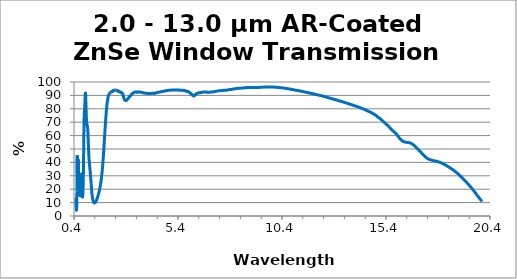
| Category | Series 1 |
|---|---|
| 0.5 | 8.167 |
| 0.501 | 10.081 |
| 0.502 | 11.8 |
| 0.503 | 13.063 |
| 0.504 | 13.66 |
| 0.505 | 13.523 |
| 0.506 | 12.763 |
| 0.507 | 11.568 |
| 0.508 | 10.196 |
| 0.509 | 8.844 |
| 0.51 | 7.629 |
| 0.511 | 6.625 |
| 0.512 | 5.827 |
| 0.513 | 5.228 |
| 0.514 | 4.792 |
| 0.515 | 4.489 |
| 0.516 | 4.301 |
| 0.517 | 4.211 |
| 0.518 | 4.211 |
| 0.519 | 4.28 |
| 0.52 | 4.416 |
| 0.521 | 4.606 |
| 0.522 | 4.855 |
| 0.523 | 5.154 |
| 0.524 | 5.504 |
| 0.525 | 5.9 |
| 0.526 | 6.349 |
| 0.527 | 6.841 |
| 0.528 | 7.367 |
| 0.529 | 7.934 |
| 0.53 | 8.549 |
| 0.531 | 9.206 |
| 0.532 | 9.9 |
| 0.533 | 10.646 |
| 0.534 | 11.454 |
| 0.535 | 12.329 |
| 0.536 | 13.289 |
| 0.537 | 14.353 |
| 0.538 | 15.541 |
| 0.539 | 16.882 |
| 0.54 | 18.368 |
| 0.541 | 20.038 |
| 0.542 | 21.914 |
| 0.543 | 23.991 |
| 0.544 | 26.266 |
| 0.545 | 28.727 |
| 0.546 | 31.334 |
| 0.547 | 34.025 |
| 0.548 | 36.642 |
| 0.549 | 39.138 |
| 0.55 | 41.369 |
| 0.551 | 43.197 |
| 0.552 | 44.516 |
| 0.553 | 45.275 |
| 0.554 | 45.439 |
| 0.555 | 45.029 |
| 0.556 | 44.108 |
| 0.557 | 42.786 |
| 0.558 | 41.137 |
| 0.559 | 39.322 |
| 0.56 | 37.417 |
| 0.561 | 35.484 |
| 0.562 | 33.618 |
| 0.563 | 31.849 |
| 0.564 | 30.203 |
| 0.565 | 28.693 |
| 0.566 | 27.32 |
| 0.567 | 26.108 |
| 0.568 | 25.045 |
| 0.569 | 24.116 |
| 0.57 | 23.332 |
| 0.571 | 22.684 |
| 0.572 | 22.15 |
| 0.573 | 21.728 |
| 0.574 | 21.409 |
| 0.575 | 21.194 |
| 0.576 | 21.08 |
| 0.577 | 21.055 |
| 0.578 | 21.123 |
| 0.579 | 21.275 |
| 0.58 | 21.517 |
| 0.581 | 21.844 |
| 0.582 | 22.261 |
| 0.583 | 22.756 |
| 0.584 | 23.338 |
| 0.585 | 24.003 |
| 0.586 | 24.754 |
| 0.587 | 25.578 |
| 0.588 | 26.495 |
| 0.589 | 27.486 |
| 0.59 | 28.552 |
| 0.591 | 29.668 |
| 0.592 | 30.85 |
| 0.593 | 32.082 |
| 0.594 | 33.333 |
| 0.595 | 34.589 |
| 0.596 | 35.844 |
| 0.597 | 37.054 |
| 0.598 | 38.201 |
| 0.599 | 39.252 |
| 0.6 | 40.191 |
| 0.601 | 40.987 |
| 0.602 | 41.613 |
| 0.603 | 42.057 |
| 0.604 | 42.317 |
| 0.605 | 42.388 |
| 0.606 | 42.27 |
| 0.607 | 41.987 |
| 0.608 | 41.544 |
| 0.609 | 40.96 |
| 0.61 | 40.272 |
| 0.611 | 39.497 |
| 0.612 | 38.648 |
| 0.613 | 37.758 |
| 0.614 | 36.842 |
| 0.615 | 35.912 |
| 0.616 | 34.985 |
| 0.617 | 34.065 |
| 0.618 | 33.177 |
| 0.619 | 32.313 |
| 0.62 | 31.468 |
| 0.621 | 30.663 |
| 0.622 | 29.898 |
| 0.623 | 29.156 |
| 0.624 | 28.45 |
| 0.625 | 27.774 |
| 0.626 | 27.131 |
| 0.627 | 26.511 |
| 0.628 | 25.91 |
| 0.629 | 25.338 |
| 0.63 | 24.787 |
| 0.631 | 24.244 |
| 0.632 | 23.722 |
| 0.633 | 23.208 |
| 0.634 | 22.71 |
| 0.635 | 22.218 |
| 0.636 | 21.73 |
| 0.637 | 21.263 |
| 0.638 | 20.8 |
| 0.639 | 20.343 |
| 0.64 | 19.899 |
| 0.641 | 19.468 |
| 0.642 | 19.05 |
| 0.643 | 18.648 |
| 0.644 | 18.257 |
| 0.645 | 17.89 |
| 0.646 | 17.542 |
| 0.647 | 17.212 |
| 0.648 | 16.907 |
| 0.649 | 16.627 |
| 0.65 | 16.372 |
| 0.651 | 16.142 |
| 0.652 | 15.938 |
| 0.653 | 15.766 |
| 0.654 | 15.622 |
| 0.655 | 15.507 |
| 0.656 | 15.422 |
| 0.657 | 15.37 |
| 0.658 | 15.35 |
| 0.659 | 15.362 |
| 0.66 | 15.406 |
| 0.661 | 15.481 |
| 0.662 | 15.594 |
| 0.663 | 15.738 |
| 0.664 | 15.918 |
| 0.665 | 16.129 |
| 0.666 | 16.376 |
| 0.667 | 16.658 |
| 0.668 | 16.978 |
| 0.669 | 17.326 |
| 0.67 | 17.708 |
| 0.671 | 18.125 |
| 0.672 | 18.568 |
| 0.673 | 19.038 |
| 0.674 | 19.537 |
| 0.675 | 20.058 |
| 0.676 | 20.592 |
| 0.677 | 21.137 |
| 0.678 | 21.689 |
| 0.679 | 22.241 |
| 0.68 | 22.78 |
| 0.681 | 23.302 |
| 0.682 | 23.8 |
| 0.683 | 24.274 |
| 0.684 | 24.687 |
| 0.685 | 25.048 |
| 0.686 | 25.348 |
| 0.687 | 25.58 |
| 0.688 | 25.739 |
| 0.689 | 25.82 |
| 0.69 | 25.824 |
| 0.691 | 25.744 |
| 0.692 | 25.598 |
| 0.693 | 25.375 |
| 0.694 | 25.082 |
| 0.695 | 24.734 |
| 0.696 | 24.339 |
| 0.697 | 23.9 |
| 0.698 | 23.423 |
| 0.699 | 22.928 |
| 0.7 | 22.416 |
| 0.701 | 21.892 |
| 0.702 | 21.364 |
| 0.703 | 20.84 |
| 0.704 | 20.328 |
| 0.705 | 19.827 |
| 0.706 | 19.339 |
| 0.707 | 18.876 |
| 0.708 | 18.434 |
| 0.709 | 18.015 |
| 0.71 | 17.621 |
| 0.711 | 17.255 |
| 0.712 | 16.914 |
| 0.713 | 16.602 |
| 0.714 | 16.319 |
| 0.715 | 16.061 |
| 0.716 | 15.836 |
| 0.717 | 15.633 |
| 0.718 | 15.461 |
| 0.719 | 15.315 |
| 0.72 | 15.204 |
| 0.721 | 15.119 |
| 0.722 | 15.06 |
| 0.723 | 15.029 |
| 0.724 | 15.023 |
| 0.725 | 15.043 |
| 0.726 | 15.093 |
| 0.727 | 15.173 |
| 0.728 | 15.271 |
| 0.729 | 15.403 |
| 0.73 | 15.564 |
| 0.731 | 15.747 |
| 0.732 | 15.966 |
| 0.733 | 16.222 |
| 0.734 | 16.493 |
| 0.735 | 16.799 |
| 0.736 | 17.148 |
| 0.737 | 17.511 |
| 0.738 | 17.91 |
| 0.739 | 18.363 |
| 0.74 | 18.842 |
| 0.741 | 19.329 |
| 0.742 | 19.872 |
| 0.743 | 20.439 |
| 0.744 | 21.027 |
| 0.745 | 21.662 |
| 0.746 | 22.339 |
| 0.747 | 22.996 |
| 0.748 | 23.696 |
| 0.749 | 24.421 |
| 0.75 | 25.111 |
| 0.751 | 25.856 |
| 0.752 | 26.598 |
| 0.753 | 27.283 |
| 0.754 | 27.966 |
| 0.755 | 28.629 |
| 0.756 | 29.221 |
| 0.757 | 29.774 |
| 0.758 | 30.281 |
| 0.759 | 30.695 |
| 0.76 | 31.026 |
| 0.761 | 31.28 |
| 0.762 | 31.449 |
| 0.763 | 31.51 |
| 0.764 | 31.472 |
| 0.765 | 31.341 |
| 0.766 | 31.126 |
| 0.767 | 30.812 |
| 0.768 | 30.414 |
| 0.769 | 29.973 |
| 0.77 | 29.439 |
| 0.771 | 28.844 |
| 0.772 | 28.253 |
| 0.773 | 27.609 |
| 0.774 | 26.926 |
| 0.775 | 26.258 |
| 0.776 | 25.56 |
| 0.777 | 24.847 |
| 0.778 | 24.179 |
| 0.779 | 23.513 |
| 0.78 | 22.838 |
| 0.781 | 22.221 |
| 0.782 | 21.611 |
| 0.783 | 20.996 |
| 0.784 | 20.426 |
| 0.785 | 19.903 |
| 0.786 | 19.388 |
| 0.787 | 18.9 |
| 0.788 | 18.455 |
| 0.789 | 18.013 |
| 0.79 | 17.596 |
| 0.791 | 17.235 |
| 0.792 | 16.879 |
| 0.793 | 16.546 |
| 0.794 | 16.256 |
| 0.795 | 15.969 |
| 0.796 | 15.7 |
| 0.797 | 15.474 |
| 0.798 | 15.259 |
| 0.799 | 15.068 |
| 0.8 | 14.89 |
| 0.801 | 14.734 |
| 0.802 | 14.595 |
| 0.803 | 14.482 |
| 0.804 | 14.384 |
| 0.805 | 14.303 |
| 0.806 | 14.239 |
| 0.807 | 14.193 |
| 0.808 | 14.164 |
| 0.809 | 14.148 |
| 0.81 | 14.152 |
| 0.811 | 14.17 |
| 0.812 | 14.205 |
| 0.813 | 14.252 |
| 0.814 | 14.321 |
| 0.815 | 14.402 |
| 0.816 | 14.496 |
| 0.817 | 14.614 |
| 0.818 | 14.743 |
| 0.819 | 14.887 |
| 0.82 | 15.054 |
| 0.821 | 15.242 |
| 0.822 | 15.433 |
| 0.823 | 15.645 |
| 0.824 | 15.884 |
| 0.825 | 16.134 |
| 0.826 | 16.402 |
| 0.827 | 16.705 |
| 0.828 | 17.017 |
| 0.829 | 17.343 |
| 0.83 | 17.699 |
| 0.831 | 18.082 |
| 0.832 | 18.471 |
| 0.833 | 18.9 |
| 0.834 | 19.361 |
| 0.835 | 19.819 |
| 0.836 | 20.323 |
| 0.837 | 20.863 |
| 0.838 | 21.4 |
| 0.839 | 22.004 |
| 0.84 | 22.638 |
| 0.841 | 23.266 |
| 0.842 | 23.943 |
| 0.843 | 24.666 |
| 0.844 | 25.396 |
| 0.845 | 26.181 |
| 0.846 | 27.028 |
| 0.847 | 27.866 |
| 0.848 | 28.741 |
| 0.849 | 29.678 |
| 0.85 | 30.638 |
| 0.851 | 31.63 |
| 0.852 | 32.696 |
| 0.853 | 33.784 |
| 0.854 | 34.853 |
| 0.855 | 36.014 |
| 0.856 | 37.208 |
| 0.857 | 38.394 |
| 0.858 | 39.672 |
| 0.859 | 40.986 |
| 0.86 | 42.231 |
| 0.861 | 43.575 |
| 0.862 | 44.962 |
| 0.863 | 46.291 |
| 0.864 | 47.688 |
| 0.865 | 49.127 |
| 0.866 | 50.5 |
| 0.867 | 51.877 |
| 0.868 | 53.328 |
| 0.869 | 54.695 |
| 0.87 | 56.08 |
| 0.871 | 57.475 |
| 0.872 | 58.806 |
| 0.873 | 60.067 |
| 0.874 | 61.346 |
| 0.875 | 62.574 |
| 0.876 | 63.724 |
| 0.877 | 64.896 |
| 0.878 | 66.011 |
| 0.879 | 66.995 |
| 0.88 | 67.979 |
| 0.881 | 68.923 |
| 0.882 | 69.754 |
| 0.883 | 70.574 |
| 0.884 | 71.343 |
| 0.885 | 72.017 |
| 0.886 | 72.65 |
| 0.887 | 73.262 |
| 0.888 | 73.793 |
| 0.889 | 74.295 |
| 0.89 | 74.761 |
| 0.891 | 75.169 |
| 0.892 | 75.544 |
| 0.893 | 75.892 |
| 0.894 | 76.199 |
| 0.895 | 76.482 |
| 0.896 | 76.756 |
| 0.897 | 77.002 |
| 0.898 | 77.223 |
| 0.899 | 77.469 |
| 0.9 | 77.683 |
| 0.901 | 77.876 |
| 0.902 | 78.075 |
| 0.903 | 78.272 |
| 0.904 | 78.454 |
| 0.905 | 78.653 |
| 0.906 | 78.861 |
| 0.907 | 79.06 |
| 0.908 | 79.281 |
| 0.909 | 79.486 |
| 0.91 | 79.716 |
| 0.911 | 79.971 |
| 0.912 | 80.227 |
| 0.913 | 80.496 |
| 0.914 | 80.778 |
| 0.915 | 81.091 |
| 0.916 | 81.397 |
| 0.917 | 81.714 |
| 0.918 | 82.055 |
| 0.919 | 82.4 |
| 0.92 | 82.756 |
| 0.921 | 83.138 |
| 0.922 | 83.527 |
| 0.923 | 83.9 |
| 0.924 | 84.3 |
| 0.925 | 84.712 |
| 0.926 | 85.102 |
| 0.927 | 85.527 |
| 0.928 | 85.949 |
| 0.929 | 86.349 |
| 0.93 | 86.76 |
| 0.931 | 87.176 |
| 0.932 | 87.568 |
| 0.933 | 87.97 |
| 0.934 | 88.375 |
| 0.935 | 88.75 |
| 0.936 | 89.107 |
| 0.937 | 89.457 |
| 0.938 | 89.792 |
| 0.939 | 90.093 |
| 0.94 | 90.394 |
| 0.941 | 90.652 |
| 0.942 | 90.898 |
| 0.943 | 91.121 |
| 0.944 | 91.315 |
| 0.945 | 91.476 |
| 0.946 | 91.605 |
| 0.947 | 91.714 |
| 0.948 | 91.777 |
| 0.949 | 91.82 |
| 0.95 | 91.826 |
| 0.951 | 91.788 |
| 0.952 | 91.728 |
| 0.953 | 91.632 |
| 0.954 | 91.51 |
| 0.955 | 91.356 |
| 0.956 | 91.154 |
| 0.957 | 90.932 |
| 0.958 | 90.684 |
| 0.959 | 90.387 |
| 0.96 | 90.078 |
| 0.961 | 89.75 |
| 0.962 | 89.384 |
| 0.963 | 88.993 |
| 0.964 | 88.593 |
| 0.965 | 88.151 |
| 0.966 | 87.7 |
| 0.967 | 87.253 |
| 0.968 | 86.768 |
| 0.969 | 86.264 |
| 0.97 | 85.776 |
| 0.971 | 85.249 |
| 0.972 | 84.711 |
| 0.973 | 84.202 |
| 0.974 | 83.662 |
| 0.975 | 83.116 |
| 0.976 | 82.59 |
| 0.977 | 82.04 |
| 0.978 | 81.481 |
| 0.979 | 80.952 |
| 0.98 | 80.432 |
| 0.981 | 79.889 |
| 0.982 | 79.375 |
| 0.983 | 78.869 |
| 0.984 | 78.347 |
| 0.985 | 77.834 |
| 0.986 | 77.366 |
| 0.987 | 76.88 |
| 0.988 | 76.408 |
| 0.989 | 75.969 |
| 0.99 | 75.504 |
| 0.991 | 75.059 |
| 0.992 | 74.655 |
| 0.993 | 74.253 |
| 0.994 | 73.856 |
| 0.995 | 73.488 |
| 0.996 | 73.117 |
| 0.997 | 72.754 |
| 0.998 | 72.428 |
| 0.999 | 72.111 |
| 1.0 | 71.8 |
| 1.001 | 71.507 |
| 1.002 | 71.23 |
| 1.003 | 70.954 |
| 1.004 | 70.706 |
| 1.005 | 70.47 |
| 1.006 | 70.245 |
| 1.007 | 70.032 |
| 1.008 | 69.839 |
| 1.009 | 69.642 |
| 1.01 | 69.466 |
| 1.011 | 69.301 |
| 1.012 | 69.147 |
| 1.013 | 69.003 |
| 1.014 | 68.878 |
| 1.015 | 68.753 |
| 1.016 | 68.638 |
| 1.017 | 68.54 |
| 1.018 | 68.436 |
| 1.019 | 68.346 |
| 1.02 | 68.267 |
| 1.021 | 68.195 |
| 1.022 | 68.13 |
| 1.023 | 68.069 |
| 1.024 | 68.015 |
| 1.025 | 67.958 |
| 1.026 | 67.909 |
| 1.027 | 67.864 |
| 1.028 | 67.821 |
| 1.029 | 67.779 |
| 1.03 | 67.738 |
| 1.031 | 67.7 |
| 1.032 | 67.661 |
| 1.033 | 67.624 |
| 1.034 | 67.575 |
| 1.035 | 67.535 |
| 1.036 | 67.49 |
| 1.037 | 67.437 |
| 1.038 | 67.389 |
| 1.039 | 67.336 |
| 1.04 | 67.276 |
| 1.041 | 67.204 |
| 1.042 | 67.134 |
| 1.043 | 67.052 |
| 1.044 | 66.962 |
| 1.045 | 66.872 |
| 1.046 | 66.775 |
| 1.047 | 66.66 |
| 1.048 | 66.541 |
| 1.049 | 66.423 |
| 1.05 | 66.336 |
| 1.051 | 66.194 |
| 1.052 | 66.045 |
| 1.053 | 65.891 |
| 1.054 | 65.702 |
| 1.055 | 65.532 |
| 1.056 | 65.322 |
| 1.057 | 65.101 |
| 1.058 | 64.9 |
| 1.059 | 64.664 |
| 1.06 | 64.417 |
| 1.061 | 64.182 |
| 1.062 | 63.941 |
| 1.063 | 63.666 |
| 1.064 | 63.391 |
| 1.065 | 63.089 |
| 1.066 | 62.783 |
| 1.067 | 62.478 |
| 1.068 | 62.163 |
| 1.069 | 61.833 |
| 1.07 | 61.508 |
| 1.071 | 61.172 |
| 1.072 | 60.811 |
| 1.073 | 60.447 |
| 1.074 | 60.108 |
| 1.075 | 59.724 |
| 1.076 | 59.348 |
| 1.077 | 58.987 |
| 1.078 | 58.596 |
| 1.079 | 58.195 |
| 1.08 | 57.815 |
| 1.081 | 57.425 |
| 1.082 | 57.031 |
| 1.083 | 56.64 |
| 1.084 | 56.233 |
| 1.085 | 55.828 |
| 1.086 | 55.438 |
| 1.087 | 55.046 |
| 1.088 | 54.644 |
| 1.089 | 54.252 |
| 1.09 | 53.857 |
| 1.091 | 53.438 |
| 1.092 | 53.043 |
| 1.093 | 52.661 |
| 1.094 | 52.256 |
| 1.095 | 51.876 |
| 1.096 | 51.491 |
| 1.097 | 51.088 |
| 1.098 | 50.721 |
| 1.099 | 50.374 |
| 1.1 | 49.993 |
| 1.101 | 49.622 |
| 1.102 | 49.274 |
| 1.103 | 48.91 |
| 1.104 | 48.531 |
| 1.105 | 48.199 |
| 1.106 | 47.851 |
| 1.107 | 47.521 |
| 1.108 | 47.18 |
| 1.109 | 46.849 |
| 1.11 | 46.521 |
| 1.111 | 46.201 |
| 1.112 | 45.895 |
| 1.113 | 45.584 |
| 1.114 | 45.28 |
| 1.115 | 44.989 |
| 1.116 | 44.684 |
| 1.117 | 44.395 |
| 1.118 | 44.127 |
| 1.119 | 43.844 |
| 1.12 | 43.58 |
| 1.121 | 43.316 |
| 1.122 | 43.049 |
| 1.123 | 42.777 |
| 1.124 | 42.534 |
| 1.125 | 42.275 |
| 1.126 | 42.033 |
| 1.127 | 41.804 |
| 1.128 | 41.592 |
| 1.129 | 41.352 |
| 1.13 | 41.134 |
| 1.131 | 40.917 |
| 1.132 | 40.692 |
| 1.133 | 40.487 |
| 1.134 | 40.286 |
| 1.135 | 40.075 |
| 1.136 | 39.869 |
| 1.137 | 39.686 |
| 1.138 | 39.493 |
| 1.139 | 39.316 |
| 1.14 | 39.13 |
| 1.141 | 38.939 |
| 1.142 | 38.766 |
| 1.143 | 38.607 |
| 1.144 | 38.43 |
| 1.145 | 38.255 |
| 1.146 | 38.103 |
| 1.147 | 37.924 |
| 1.148 | 37.757 |
| 1.149 | 37.609 |
| 1.15 | 37.449 |
| 1.151 | 37.296 |
| 1.152 | 37.136 |
| 1.153 | 36.989 |
| 1.154 | 36.833 |
| 1.155 | 36.678 |
| 1.156 | 36.535 |
| 1.157 | 36.385 |
| 1.158 | 36.248 |
| 1.159 | 36.094 |
| 1.16 | 35.939 |
| 1.161 | 35.792 |
| 1.162 | 35.649 |
| 1.163 | 35.5 |
| 1.164 | 35.349 |
| 1.165 | 35.222 |
| 1.166 | 35.058 |
| 1.167 | 34.912 |
| 1.168 | 34.769 |
| 1.169 | 34.624 |
| 1.17 | 34.462 |
| 1.171 | 34.318 |
| 1.172 | 34.163 |
| 1.173 | 34.007 |
| 1.174 | 33.86 |
| 1.175 | 33.698 |
| 1.176 | 33.54 |
| 1.177 | 33.389 |
| 1.178 | 33.226 |
| 1.179 | 33.052 |
| 1.18 | 32.888 |
| 1.181 | 32.73 |
| 1.182 | 32.557 |
| 1.183 | 32.385 |
| 1.184 | 32.226 |
| 1.185 | 32.042 |
| 1.186 | 31.866 |
| 1.187 | 31.697 |
| 1.188 | 31.517 |
| 1.189 | 31.332 |
| 1.19 | 31.149 |
| 1.191 | 30.956 |
| 1.192 | 30.77 |
| 1.193 | 30.589 |
| 1.194 | 30.393 |
| 1.195 | 30.196 |
| 1.196 | 30.012 |
| 1.197 | 29.81 |
| 1.198 | 29.606 |
| 1.199 | 29.411 |
| 1.2 | 29.201 |
| 1.201 | 28.992 |
| 1.202 | 28.792 |
| 1.203 | 28.591 |
| 1.204 | 28.377 |
| 1.205 | 28.167 |
| 1.206 | 27.963 |
| 1.207 | 27.747 |
| 1.208 | 27.538 |
| 1.209 | 27.33 |
| 1.21 | 27.113 |
| 1.211 | 26.893 |
| 1.212 | 26.686 |
| 1.213 | 26.471 |
| 1.214 | 26.252 |
| 1.215 | 26.036 |
| 1.216 | 25.818 |
| 1.217 | 25.597 |
| 1.218 | 25.388 |
| 1.219 | 25.173 |
| 1.22 | 24.949 |
| 1.221 | 24.745 |
| 1.222 | 24.529 |
| 1.223 | 24.303 |
| 1.224 | 24.084 |
| 1.225 | 23.885 |
| 1.226 | 23.664 |
| 1.227 | 23.445 |
| 1.228 | 23.241 |
| 1.229 | 23.025 |
| 1.23 | 22.807 |
| 1.231 | 22.612 |
| 1.232 | 22.402 |
| 1.233 | 22.188 |
| 1.234 | 21.99 |
| 1.235 | 21.774 |
| 1.236 | 21.569 |
| 1.237 | 21.372 |
| 1.238 | 21.177 |
| 1.239 | 20.971 |
| 1.24 | 20.778 |
| 1.241 | 20.587 |
| 1.242 | 20.382 |
| 1.243 | 20.199 |
| 1.244 | 20.013 |
| 1.245 | 19.821 |
| 1.246 | 19.636 |
| 1.247 | 19.451 |
| 1.248 | 19.267 |
| 1.249 | 19.081 |
| 1.25 | 18.912 |
| 1.251 | 18.731 |
| 1.252 | 18.552 |
| 1.253 | 18.388 |
| 1.254 | 18.219 |
| 1.255 | 18.042 |
| 1.256 | 17.882 |
| 1.257 | 17.717 |
| 1.258 | 17.552 |
| 1.259 | 17.403 |
| 1.26 | 17.238 |
| 1.261 | 17.077 |
| 1.262 | 16.929 |
| 1.263 | 16.783 |
| 1.264 | 16.63 |
| 1.265 | 16.483 |
| 1.266 | 16.332 |
| 1.267 | 16.194 |
| 1.268 | 16.055 |
| 1.269 | 15.912 |
| 1.27 | 15.781 |
| 1.271 | 15.641 |
| 1.272 | 15.516 |
| 1.273 | 15.381 |
| 1.274 | 15.244 |
| 1.275 | 15.127 |
| 1.276 | 15.002 |
| 1.277 | 14.877 |
| 1.278 | 14.761 |
| 1.279 | 14.641 |
| 1.28 | 14.518 |
| 1.281 | 14.411 |
| 1.282 | 14.302 |
| 1.283 | 14.187 |
| 1.284 | 14.077 |
| 1.285 | 13.974 |
| 1.286 | 13.861 |
| 1.287 | 13.763 |
| 1.288 | 13.662 |
| 1.289 | 13.56 |
| 1.29 | 13.463 |
| 1.291 | 13.371 |
| 1.292 | 13.268 |
| 1.293 | 13.176 |
| 1.294 | 13.095 |
| 1.295 | 13 |
| 1.296 | 12.912 |
| 1.297 | 12.826 |
| 1.298 | 12.741 |
| 1.299 | 12.65 |
| 1.3 | 12.583 |
| 1.301 | 12.497 |
| 1.302 | 12.416 |
| 1.303 | 12.348 |
| 1.304 | 12.266 |
| 1.305 | 12.188 |
| 1.306 | 12.119 |
| 1.307 | 12.046 |
| 1.308 | 11.977 |
| 1.309 | 11.911 |
| 1.31 | 11.848 |
| 1.311 | 11.775 |
| 1.312 | 11.713 |
| 1.313 | 11.648 |
| 1.314 | 11.596 |
| 1.315 | 11.528 |
| 1.316 | 11.469 |
| 1.317 | 11.411 |
| 1.318 | 11.355 |
| 1.319 | 11.298 |
| 1.32 | 11.243 |
| 1.321 | 11.189 |
| 1.322 | 11.143 |
| 1.323 | 11.092 |
| 1.324 | 11.037 |
| 1.325 | 10.989 |
| 1.326 | 10.943 |
| 1.327 | 10.898 |
| 1.328 | 10.857 |
| 1.329 | 10.807 |
| 1.33 | 10.772 |
| 1.331 | 10.726 |
| 1.332 | 10.685 |
| 1.333 | 10.645 |
| 1.334 | 10.604 |
| 1.335 | 10.57 |
| 1.336 | 10.531 |
| 1.337 | 10.491 |
| 1.338 | 10.46 |
| 1.339 | 10.427 |
| 1.34 | 10.39 |
| 1.341 | 10.359 |
| 1.342 | 10.329 |
| 1.343 | 10.296 |
| 1.344 | 10.27 |
| 1.345 | 10.239 |
| 1.346 | 10.212 |
| 1.347 | 10.183 |
| 1.348 | 10.16 |
| 1.349 | 10.134 |
| 1.35 | 10.113 |
| 1.351 | 10.091 |
| 1.352 | 10.075 |
| 1.353 | 10.043 |
| 1.354 | 10.03 |
| 1.355 | 10.006 |
| 1.356 | 9.983 |
| 1.357 | 9.961 |
| 1.358 | 9.947 |
| 1.359 | 9.933 |
| 1.36 | 9.914 |
| 1.361 | 9.893 |
| 1.362 | 9.883 |
| 1.363 | 9.872 |
| 1.364 | 9.853 |
| 1.365 | 9.847 |
| 1.366 | 9.824 |
| 1.367 | 9.814 |
| 1.368 | 9.811 |
| 1.369 | 9.796 |
| 1.37 | 9.788 |
| 1.371 | 9.782 |
| 1.372 | 9.771 |
| 1.373 | 9.768 |
| 1.374 | 9.757 |
| 1.375 | 9.756 |
| 1.376 | 9.75 |
| 1.377 | 9.744 |
| 1.378 | 9.743 |
| 1.379 | 9.729 |
| 1.38 | 9.732 |
| 1.381 | 9.725 |
| 1.382 | 9.731 |
| 1.383 | 9.727 |
| 1.384 | 9.728 |
| 1.385 | 9.727 |
| 1.386 | 9.727 |
| 1.387 | 9.729 |
| 1.388 | 9.728 |
| 1.389 | 9.731 |
| 1.39 | 9.733 |
| 1.391 | 9.735 |
| 1.392 | 9.741 |
| 1.393 | 9.748 |
| 1.394 | 9.755 |
| 1.395 | 9.756 |
| 1.396 | 9.763 |
| 1.397 | 9.772 |
| 1.398 | 9.773 |
| 1.399 | 9.787 |
| 1.4 | 9.796 |
| 1.401 | 9.804 |
| 1.402 | 9.813 |
| 1.403 | 9.818 |
| 1.404 | 9.827 |
| 1.405 | 9.836 |
| 1.406 | 9.858 |
| 1.407 | 9.86 |
| 1.408 | 9.881 |
| 1.409 | 9.891 |
| 1.41 | 9.897 |
| 1.411 | 9.908 |
| 1.412 | 9.922 |
| 1.413 | 9.942 |
| 1.414 | 9.955 |
| 1.415 | 9.967 |
| 1.416 | 9.99 |
| 1.417 | 10.004 |
| 1.418 | 10.022 |
| 1.419 | 10.036 |
| 1.42 | 10.059 |
| 1.421 | 10.07 |
| 1.422 | 10.089 |
| 1.423 | 10.105 |
| 1.424 | 10.124 |
| 1.425 | 10.147 |
| 1.426 | 10.166 |
| 1.427 | 10.19 |
| 1.428 | 10.209 |
| 1.429 | 10.23 |
| 1.43 | 10.25 |
| 1.431 | 10.273 |
| 1.432 | 10.292 |
| 1.433 | 10.318 |
| 1.434 | 10.334 |
| 1.435 | 10.365 |
| 1.436 | 10.389 |
| 1.437 | 10.416 |
| 1.438 | 10.433 |
| 1.439 | 10.463 |
| 1.44 | 10.483 |
| 1.441 | 10.513 |
| 1.442 | 10.535 |
| 1.443 | 10.565 |
| 1.444 | 10.592 |
| 1.445 | 10.622 |
| 1.446 | 10.643 |
| 1.447 | 10.674 |
| 1.448 | 10.706 |
| 1.449 | 10.734 |
| 1.45 | 10.761 |
| 1.451 | 10.783 |
| 1.452 | 10.821 |
| 1.453 | 10.853 |
| 1.454 | 10.879 |
| 1.455 | 10.908 |
| 1.456 | 10.942 |
| 1.457 | 10.974 |
| 1.458 | 11.001 |
| 1.459 | 11.03 |
| 1.46 | 11.06 |
| 1.461 | 11.098 |
| 1.462 | 11.137 |
| 1.463 | 11.166 |
| 1.464 | 11.198 |
| 1.465 | 11.233 |
| 1.466 | 11.266 |
| 1.467 | 11.296 |
| 1.468 | 11.332 |
| 1.469 | 11.37 |
| 1.47 | 11.404 |
| 1.471 | 11.435 |
| 1.472 | 11.471 |
| 1.473 | 11.507 |
| 1.474 | 11.544 |
| 1.475 | 11.582 |
| 1.476 | 11.618 |
| 1.477 | 11.648 |
| 1.478 | 11.689 |
| 1.479 | 11.725 |
| 1.48 | 11.765 |
| 1.481 | 11.8 |
| 1.482 | 11.837 |
| 1.483 | 11.875 |
| 1.484 | 11.919 |
| 1.485 | 11.952 |
| 1.486 | 11.997 |
| 1.487 | 12.037 |
| 1.488 | 12.068 |
| 1.489 | 12.112 |
| 1.49 | 12.146 |
| 1.491 | 12.187 |
| 1.492 | 12.229 |
| 1.493 | 12.267 |
| 1.494 | 12.311 |
| 1.495 | 12.356 |
| 1.496 | 12.39 |
| 1.497 | 12.441 |
| 1.498 | 12.472 |
| 1.499 | 12.521 |
| 1.5 | 12.567 |
| 1.501 | 12.602 |
| 1.502 | 12.645 |
| 1.503 | 12.691 |
| 1.504 | 12.727 |
| 1.505 | 12.776 |
| 1.506 | 12.809 |
| 1.507 | 12.859 |
| 1.508 | 12.902 |
| 1.509 | 12.945 |
| 1.51 | 12.984 |
| 1.511 | 13.034 |
| 1.512 | 13.079 |
| 1.513 | 13.121 |
| 1.514 | 13.171 |
| 1.515 | 13.209 |
| 1.516 | 13.252 |
| 1.517 | 13.296 |
| 1.518 | 13.348 |
| 1.519 | 13.388 |
| 1.52 | 13.432 |
| 1.521 | 13.479 |
| 1.522 | 13.525 |
| 1.523 | 13.572 |
| 1.524 | 13.624 |
| 1.525 | 13.664 |
| 1.526 | 13.709 |
| 1.527 | 13.752 |
| 1.528 | 13.798 |
| 1.529 | 13.85 |
| 1.53 | 13.9 |
| 1.531 | 13.945 |
| 1.532 | 13.996 |
| 1.533 | 14.038 |
| 1.534 | 14.081 |
| 1.535 | 14.133 |
| 1.536 | 14.186 |
| 1.537 | 14.232 |
| 1.538 | 14.285 |
| 1.539 | 14.326 |
| 1.54 | 14.379 |
| 1.541 | 14.425 |
| 1.542 | 14.476 |
| 1.543 | 14.523 |
| 1.544 | 14.582 |
| 1.545 | 14.627 |
| 1.546 | 14.674 |
| 1.547 | 14.729 |
| 1.548 | 14.776 |
| 1.549 | 14.822 |
| 1.55 | 14.88 |
| 1.551 | 14.929 |
| 1.552 | 14.974 |
| 1.553 | 15.026 |
| 1.554 | 15.081 |
| 1.555 | 15.131 |
| 1.556 | 15.186 |
| 1.557 | 15.235 |
| 1.558 | 15.288 |
| 1.559 | 15.333 |
| 1.56 | 15.387 |
| 1.561 | 15.438 |
| 1.562 | 15.49 |
| 1.563 | 15.554 |
| 1.564 | 15.606 |
| 1.565 | 15.657 |
| 1.566 | 15.713 |
| 1.567 | 15.761 |
| 1.568 | 15.819 |
| 1.569 | 15.877 |
| 1.57 | 15.924 |
| 1.571 | 15.98 |
| 1.572 | 16.035 |
| 1.573 | 16.09 |
| 1.574 | 16.138 |
| 1.575 | 16.202 |
| 1.576 | 16.252 |
| 1.577 | 16.315 |
| 1.578 | 16.366 |
| 1.579 | 16.425 |
| 1.58 | 16.479 |
| 1.581 | 16.532 |
| 1.582 | 16.594 |
| 1.583 | 16.652 |
| 1.584 | 16.712 |
| 1.585 | 16.764 |
| 1.586 | 16.825 |
| 1.587 | 16.878 |
| 1.588 | 16.939 |
| 1.589 | 17.01 |
| 1.59 | 17.058 |
| 1.591 | 17.114 |
| 1.592 | 17.176 |
| 1.593 | 17.232 |
| 1.594 | 17.296 |
| 1.595 | 17.354 |
| 1.596 | 17.419 |
| 1.597 | 17.48 |
| 1.598 | 17.54 |
| 1.599 | 17.601 |
| 1.6 | 17.669 |
| 1.601 | 17.727 |
| 1.602 | 17.788 |
| 1.603 | 17.854 |
| 1.604 | 17.914 |
| 1.605 | 17.974 |
| 1.606 | 18.049 |
| 1.607 | 18.108 |
| 1.608 | 18.168 |
| 1.609 | 18.241 |
| 1.61 | 18.305 |
| 1.611 | 18.366 |
| 1.612 | 18.429 |
| 1.613 | 18.501 |
| 1.614 | 18.572 |
| 1.615 | 18.64 |
| 1.616 | 18.704 |
| 1.617 | 18.772 |
| 1.618 | 18.831 |
| 1.619 | 18.905 |
| 1.62 | 18.969 |
| 1.621 | 19.045 |
| 1.622 | 19.113 |
| 1.623 | 19.177 |
| 1.624 | 19.255 |
| 1.625 | 19.313 |
| 1.626 | 19.386 |
| 1.627 | 19.474 |
| 1.628 | 19.537 |
| 1.629 | 19.607 |
| 1.63 | 19.681 |
| 1.631 | 19.755 |
| 1.632 | 19.828 |
| 1.633 | 19.892 |
| 1.634 | 19.969 |
| 1.635 | 20.052 |
| 1.636 | 20.12 |
| 1.637 | 20.201 |
| 1.638 | 20.276 |
| 1.639 | 20.36 |
| 1.64 | 20.432 |
| 1.641 | 20.508 |
| 1.642 | 20.587 |
| 1.643 | 20.657 |
| 1.644 | 20.739 |
| 1.645 | 20.827 |
| 1.646 | 20.909 |
| 1.647 | 20.982 |
| 1.648 | 21.068 |
| 1.649 | 21.129 |
| 1.65 | 21.217 |
| 1.651 | 21.303 |
| 1.652 | 21.386 |
| 1.653 | 21.464 |
| 1.654 | 21.552 |
| 1.655 | 21.636 |
| 1.656 | 21.715 |
| 1.657 | 21.813 |
| 1.658 | 21.902 |
| 1.659 | 21.991 |
| 1.66 | 22.067 |
| 1.661 | 22.165 |
| 1.662 | 22.253 |
| 1.663 | 22.344 |
| 1.664 | 22.425 |
| 1.665 | 22.519 |
| 1.666 | 22.594 |
| 1.667 | 22.694 |
| 1.668 | 22.789 |
| 1.669 | 22.888 |
| 1.67 | 22.981 |
| 1.671 | 23.076 |
| 1.672 | 23.166 |
| 1.673 | 23.267 |
| 1.674 | 23.358 |
| 1.675 | 23.443 |
| 1.676 | 23.549 |
| 1.677 | 23.653 |
| 1.678 | 23.757 |
| 1.679 | 23.862 |
| 1.68 | 23.947 |
| 1.681 | 24.038 |
| 1.682 | 24.152 |
| 1.683 | 24.263 |
| 1.684 | 24.352 |
| 1.685 | 24.464 |
| 1.686 | 24.567 |
| 1.687 | 24.673 |
| 1.688 | 24.765 |
| 1.689 | 24.88 |
| 1.69 | 24.996 |
| 1.691 | 25.097 |
| 1.692 | 25.198 |
| 1.693 | 25.307 |
| 1.694 | 25.422 |
| 1.695 | 25.542 |
| 1.696 | 25.639 |
| 1.697 | 25.752 |
| 1.698 | 25.868 |
| 1.699 | 25.979 |
| 1.7 | 26.103 |
| 1.701 | 26.22 |
| 1.702 | 26.329 |
| 1.703 | 26.454 |
| 1.704 | 26.566 |
| 1.705 | 26.688 |
| 1.706 | 26.797 |
| 1.707 | 26.937 |
| 1.708 | 27.062 |
| 1.709 | 27.168 |
| 1.71 | 27.292 |
| 1.711 | 27.41 |
| 1.712 | 27.526 |
| 1.713 | 27.66 |
| 1.714 | 27.796 |
| 1.715 | 27.911 |
| 1.716 | 28.042 |
| 1.717 | 28.178 |
| 1.718 | 28.299 |
| 1.719 | 28.433 |
| 1.72 | 28.564 |
| 1.721 | 28.697 |
| 1.722 | 28.821 |
| 1.723 | 28.961 |
| 1.724 | 29.093 |
| 1.725 | 29.235 |
| 1.726 | 29.371 |
| 1.727 | 29.509 |
| 1.728 | 29.646 |
| 1.729 | 29.79 |
| 1.73 | 29.925 |
| 1.731 | 30.053 |
| 1.732 | 30.208 |
| 1.733 | 30.357 |
| 1.734 | 30.499 |
| 1.735 | 30.646 |
| 1.736 | 30.79 |
| 1.737 | 30.926 |
| 1.738 | 31.081 |
| 1.739 | 31.23 |
| 1.74 | 31.379 |
| 1.741 | 31.53 |
| 1.742 | 31.684 |
| 1.743 | 31.84 |
| 1.744 | 31.987 |
| 1.745 | 32.142 |
| 1.746 | 32.296 |
| 1.747 | 32.448 |
| 1.748 | 32.611 |
| 1.749 | 32.756 |
| 1.75 | 32.936 |
| 1.751 | 33.098 |
| 1.752 | 33.258 |
| 1.753 | 33.408 |
| 1.754 | 33.58 |
| 1.755 | 33.753 |
| 1.756 | 33.91 |
| 1.757 | 34.07 |
| 1.758 | 34.255 |
| 1.759 | 34.423 |
| 1.76 | 34.576 |
| 1.761 | 34.759 |
| 1.762 | 34.916 |
| 1.763 | 35.101 |
| 1.764 | 35.272 |
| 1.765 | 35.448 |
| 1.766 | 35.626 |
| 1.767 | 35.801 |
| 1.768 | 35.98 |
| 1.769 | 36.152 |
| 1.77 | 36.337 |
| 1.771 | 36.523 |
| 1.772 | 36.688 |
| 1.773 | 36.882 |
| 1.774 | 37.074 |
| 1.775 | 37.244 |
| 1.776 | 37.44 |
| 1.777 | 37.631 |
| 1.778 | 37.823 |
| 1.779 | 38.006 |
| 1.78 | 38.194 |
| 1.781 | 38.381 |
| 1.782 | 38.574 |
| 1.783 | 38.775 |
| 1.784 | 38.961 |
| 1.785 | 39.165 |
| 1.786 | 39.361 |
| 1.787 | 39.554 |
| 1.788 | 39.763 |
| 1.789 | 39.968 |
| 1.79 | 40.173 |
| 1.791 | 40.346 |
| 1.792 | 40.568 |
| 1.793 | 40.77 |
| 1.794 | 40.957 |
| 1.795 | 41.183 |
| 1.796 | 41.385 |
| 1.797 | 41.589 |
| 1.798 | 41.797 |
| 1.799 | 42.007 |
| 1.8 | 42.219 |
| 1.801 | 42.434 |
| 1.802 | 42.642 |
| 1.803 | 42.858 |
| 1.804 | 43.064 |
| 1.805 | 43.3 |
| 1.806 | 43.495 |
| 1.807 | 43.728 |
| 1.808 | 43.951 |
| 1.809 | 44.143 |
| 1.81 | 44.372 |
| 1.811 | 44.608 |
| 1.812 | 44.819 |
| 1.813 | 45.046 |
| 1.814 | 45.284 |
| 1.815 | 45.482 |
| 1.816 | 45.715 |
| 1.817 | 45.93 |
| 1.818 | 46.162 |
| 1.819 | 46.371 |
| 1.82 | 46.642 |
| 1.821 | 46.893 |
| 1.822 | 47.121 |
| 1.823 | 47.328 |
| 1.824 | 47.551 |
| 1.825 | 47.763 |
| 1.826 | 48.015 |
| 1.827 | 48.256 |
| 1.828 | 48.494 |
| 1.829 | 48.734 |
| 1.83 | 48.959 |
| 1.831 | 49.205 |
| 1.832 | 49.433 |
| 1.833 | 49.666 |
| 1.834 | 49.883 |
| 1.835 | 50.145 |
| 1.836 | 50.415 |
| 1.837 | 50.672 |
| 1.838 | 50.893 |
| 1.839 | 51.145 |
| 1.84 | 51.394 |
| 1.841 | 51.626 |
| 1.842 | 51.915 |
| 1.843 | 52.134 |
| 1.844 | 52.323 |
| 1.845 | 52.531 |
| 1.846 | 52.826 |
| 1.847 | 53.104 |
| 1.848 | 53.397 |
| 1.849 | 53.664 |
| 1.85 | 53.871 |
| 1.851 | 54.076 |
| 1.852 | 54.282 |
| 1.853 | 54.58 |
| 1.854 | 54.838 |
| 1.855 | 55.102 |
| 1.856 | 55.364 |
| 1.857 | 55.59 |
| 1.858 | 55.829 |
| 1.859 | 56.108 |
| 1.86 | 56.388 |
| 1.861 | 56.626 |
| 1.862 | 56.863 |
| 1.863 | 57.08 |
| 1.864 | 57.308 |
| 1.865 | 57.608 |
| 1.866 | 57.815 |
| 1.867 | 58.053 |
| 1.868 | 58.324 |
| 1.869 | 58.604 |
| 1.87 | 58.855 |
| 1.871 | 59.137 |
| 1.872 | 59.392 |
| 1.873 | 59.675 |
| 1.874 | 59.936 |
| 1.875 | 60.188 |
| 1.876 | 60.44 |
| 1.877 | 60.659 |
| 1.878 | 60.919 |
| 1.879 | 61.124 |
| 1.88 | 61.353 |
| 1.881 | 61.611 |
| 1.882 | 61.88 |
| 1.883 | 62.137 |
| 1.884 | 62.413 |
| 1.885 | 62.655 |
| 1.886 | 62.894 |
| 1.887 | 63.154 |
| 1.888 | 63.385 |
| 1.889 | 63.634 |
| 1.89 | 63.908 |
| 1.891 | 64.137 |
| 1.892 | 64.407 |
| 1.893 | 64.687 |
| 1.894 | 64.882 |
| 1.895 | 65.135 |
| 1.896 | 65.346 |
| 1.897 | 65.582 |
| 1.898 | 65.833 |
| 1.899 | 66.081 |
| 1.9 | 66.381 |
| 1.901 | 66.604 |
| 1.902 | 66.845 |
| 1.903 | 67.073 |
| 1.904 | 67.302 |
| 1.905 | 67.563 |
| 1.906 | 67.836 |
| 1.907 | 68.082 |
| 1.908 | 68.3 |
| 1.909 | 68.53 |
| 1.91 | 68.724 |
| 1.911 | 68.979 |
| 1.912 | 69.228 |
| 1.913 | 69.493 |
| 1.914 | 69.7 |
| 1.915 | 69.971 |
| 1.916 | 70.148 |
| 1.917 | 70.369 |
| 1.918 | 70.59 |
| 1.919 | 70.831 |
| 1.92 | 71.078 |
| 1.921 | 71.331 |
| 1.922 | 71.563 |
| 1.923 | 71.779 |
| 1.924 | 71.948 |
| 1.925 | 72.207 |
| 1.926 | 72.397 |
| 1.927 | 72.646 |
| 1.928 | 72.884 |
| 1.929 | 73.097 |
| 1.93 | 73.297 |
| 1.931 | 73.559 |
| 1.932 | 73.709 |
| 1.933 | 73.946 |
| 1.934 | 74.163 |
| 1.935 | 74.327 |
| 1.936 | 74.545 |
| 1.937 | 74.782 |
| 1.938 | 74.972 |
| 1.939 | 75.184 |
| 1.94 | 75.423 |
| 1.941 | 75.591 |
| 1.942 | 75.833 |
| 1.943 | 76 |
| 1.944 | 76.206 |
| 1.945 | 76.402 |
| 1.946 | 76.61 |
| 1.947 | 76.793 |
| 1.948 | 76.994 |
| 1.949 | 77.184 |
| 1.95 | 77.379 |
| 1.951 | 77.583 |
| 1.952 | 77.745 |
| 1.953 | 77.935 |
| 1.954 | 78.16 |
| 1.955 | 78.297 |
| 1.956 | 78.516 |
| 1.957 | 78.699 |
| 1.958 | 78.863 |
| 1.959 | 79.046 |
| 1.96 | 79.221 |
| 1.961 | 79.405 |
| 1.962 | 79.622 |
| 1.963 | 79.754 |
| 1.964 | 79.921 |
| 1.965 | 80.082 |
| 1.966 | 80.259 |
| 1.967 | 80.426 |
| 1.968 | 80.599 |
| 1.969 | 80.771 |
| 1.97 | 80.908 |
| 1.971 | 81.06 |
| 1.972 | 81.261 |
| 1.973 | 81.426 |
| 1.974 | 81.555 |
| 1.975 | 81.726 |
| 1.976 | 81.895 |
| 1.977 | 81.991 |
| 1.978 | 82.193 |
| 1.979 | 82.322 |
| 1.98 | 82.453 |
| 1.981 | 82.621 |
| 1.982 | 82.755 |
| 1.983 | 82.886 |
| 1.984 | 83.037 |
| 1.985 | 83.182 |
| 1.986 | 83.303 |
| 1.987 | 83.466 |
| 1.988 | 83.587 |
| 1.989 | 83.695 |
| 1.99 | 83.852 |
| 1.991 | 83.974 |
| 1.992 | 84.121 |
| 1.993 | 84.242 |
| 1.994 | 84.372 |
| 1.995 | 84.499 |
| 1.996 | 84.624 |
| 1.997 | 84.746 |
| 1.998 | 84.85 |
| 1.999 | 85 |
| 2.0 | 85.103 |
| 2.001 | 85.21 |
| 2.002 | 85.358 |
| 2.003 | 85.433 |
| 2.004 | 85.575 |
| 2.005 | 85.669 |
| 2.006 | 85.79 |
| 2.007 | 85.883 |
| 2.008 | 86.014 |
| 2.009 | 86.062 |
| 2.01 | 86.198 |
| 2.011 | 86.285 |
| 2.012 | 86.4 |
| 2.013 | 86.498 |
| 2.014 | 86.595 |
| 2.015 | 86.711 |
| 2.016 | 86.809 |
| 2.017 | 86.899 |
| 2.018 | 86.974 |
| 2.019 | 87.068 |
| 2.02 | 87.148 |
| 2.021 | 87.24 |
| 2.022 | 87.344 |
| 2.023 | 87.393 |
| 2.024 | 87.522 |
| 2.025 | 87.568 |
| 2.026 | 87.726 |
| 2.027 | 87.733 |
| 2.028 | 87.814 |
| 2.029 | 87.947 |
| 2.03 | 88.013 |
| 2.031 | 88.04 |
| 2.032 | 88.146 |
| 2.033 | 88.21 |
| 2.034 | 88.301 |
| 2.035 | 88.41 |
| 2.036 | 88.433 |
| 2.037 | 88.533 |
| 2.038 | 88.607 |
| 2.039 | 88.629 |
| 2.04 | 88.718 |
| 2.041 | 88.793 |
| 2.042 | 88.835 |
| 2.043 | 88.932 |
| 2.044 | 88.985 |
| 2.045 | 89.072 |
| 2.046 | 89.104 |
| 2.047 | 89.148 |
| 2.048 | 89.212 |
| 2.049 | 89.242 |
| 2.05 | 89.365 |
| 2.051 | 89.373 |
| 2.052 | 89.443 |
| 2.053 | 89.505 |
| 2.054 | 89.569 |
| 2.055 | 89.63 |
| 2.056 | 89.679 |
| 2.057 | 89.736 |
| 2.058 | 89.797 |
| 2.059 | 89.794 |
| 2.06 | 89.892 |
| 2.061 | 89.919 |
| 2.062 | 89.989 |
| 2.063 | 90.003 |
| 2.064 | 90.066 |
| 2.065 | 90.115 |
| 2.066 | 90.125 |
| 2.067 | 90.223 |
| 2.068 | 90.255 |
| 2.069 | 90.274 |
| 2.07 | 90.364 |
| 2.071 | 90.327 |
| 2.072 | 90.428 |
| 2.073 | 90.429 |
| 2.074 | 90.467 |
| 2.075 | 90.488 |
| 2.076 | 90.553 |
| 2.077 | 90.593 |
| 2.078 | 90.65 |
| 2.079 | 90.684 |
| 2.08 | 90.729 |
| 2.081 | 90.775 |
| 2.082 | 90.782 |
| 2.083 | 90.773 |
| 2.084 | 90.821 |
| 2.085 | 90.831 |
| 2.086 | 90.896 |
| 2.087 | 90.939 |
| 2.088 | 90.948 |
| 2.089 | 90.982 |
| 2.09 | 91.025 |
| 2.091 | 91.032 |
| 2.092 | 91.086 |
| 2.093 | 91.076 |
| 2.094 | 91.131 |
| 2.095 | 91.18 |
| 2.096 | 91.167 |
| 2.097 | 91.194 |
| 2.098 | 91.207 |
| 2.099 | 91.278 |
| 2.1 | 91.253 |
| 2.101 | 91.318 |
| 2.102 | 91.308 |
| 2.103 | 91.358 |
| 2.104 | 91.327 |
| 2.105 | 91.399 |
| 2.106 | 91.442 |
| 2.107 | 91.431 |
| 2.108 | 91.424 |
| 2.109 | 91.511 |
| 2.11 | 91.513 |
| 2.111 | 91.503 |
| 2.112 | 91.537 |
| 2.113 | 91.541 |
| 2.114 | 91.583 |
| 2.115 | 91.627 |
| 2.116 | 91.628 |
| 2.117 | 91.634 |
| 2.118 | 91.664 |
| 2.119 | 91.693 |
| 2.12 | 91.715 |
| 2.121 | 91.685 |
| 2.122 | 91.784 |
| 2.123 | 91.777 |
| 2.124 | 91.772 |
| 2.125 | 91.773 |
| 2.126 | 91.843 |
| 2.127 | 91.81 |
| 2.128 | 91.844 |
| 2.129 | 91.863 |
| 2.13 | 91.932 |
| 2.131 | 91.876 |
| 2.132 | 91.925 |
| 2.133 | 91.904 |
| 2.134 | 91.978 |
| 2.135 | 91.895 |
| 2.136 | 91.951 |
| 2.137 | 91.984 |
| 2.138 | 92.003 |
| 2.139 | 91.971 |
| 2.14 | 92.048 |
| 2.141 | 92.045 |
| 2.142 | 92.066 |
| 2.143 | 92.078 |
| 2.144 | 92.114 |
| 2.145 | 92.073 |
| 2.146 | 92.116 |
| 2.147 | 92.136 |
| 2.148 | 92.144 |
| 2.149 | 92.165 |
| 2.15 | 92.144 |
| 2.151 | 92.152 |
| 2.152 | 92.171 |
| 2.153 | 92.224 |
| 2.154 | 92.204 |
| 2.155 | 92.207 |
| 2.156 | 92.217 |
| 2.157 | 92.23 |
| 2.158 | 92.238 |
| 2.159 | 92.249 |
| 2.16 | 92.285 |
| 2.161 | 92.296 |
| 2.162 | 92.24 |
| 2.163 | 92.293 |
| 2.164 | 92.34 |
| 2.165 | 92.354 |
| 2.166 | 92.322 |
| 2.167 | 92.367 |
| 2.168 | 92.366 |
| 2.169 | 92.409 |
| 2.17 | 92.437 |
| 2.171 | 92.402 |
| 2.172 | 92.405 |
| 2.173 | 92.46 |
| 2.174 | 92.441 |
| 2.175 | 92.434 |
| 2.176 | 92.487 |
| 2.177 | 92.459 |
| 2.178 | 92.498 |
| 2.179 | 92.509 |
| 2.18 | 92.533 |
| 2.181 | 92.493 |
| 2.182 | 92.57 |
| 2.183 | 92.53 |
| 2.184 | 92.49 |
| 2.185 | 92.558 |
| 2.186 | 92.553 |
| 2.187 | 92.56 |
| 2.188 | 92.582 |
| 2.189 | 92.566 |
| 2.19 | 92.592 |
| 2.191 | 92.622 |
| 2.192 | 92.643 |
| 2.193 | 92.655 |
| 2.194 | 92.647 |
| 2.195 | 92.622 |
| 2.196 | 92.624 |
| 2.197 | 92.667 |
| 2.198 | 92.693 |
| 2.199 | 92.675 |
| 2.2 | 92.708 |
| 2.201 | 92.685 |
| 2.202 | 92.723 |
| 2.203 | 92.711 |
| 2.204 | 92.752 |
| 2.205 | 92.723 |
| 2.206 | 92.747 |
| 2.207 | 92.748 |
| 2.208 | 92.785 |
| 2.209 | 92.792 |
| 2.21 | 92.794 |
| 2.211 | 92.824 |
| 2.212 | 92.8 |
| 2.213 | 92.829 |
| 2.214 | 92.877 |
| 2.215 | 92.874 |
| 2.216 | 92.88 |
| 2.217 | 92.909 |
| 2.218 | 92.852 |
| 2.219 | 92.929 |
| 2.22 | 92.89 |
| 2.221 | 92.917 |
| 2.222 | 92.91 |
| 2.223 | 92.923 |
| 2.224 | 92.933 |
| 2.225 | 92.924 |
| 2.226 | 92.98 |
| 2.227 | 92.994 |
| 2.228 | 93.057 |
| 2.229 | 92.926 |
| 2.23 | 92.987 |
| 2.231 | 93.011 |
| 2.232 | 93.03 |
| 2.233 | 92.956 |
| 2.234 | 92.968 |
| 2.235 | 93.062 |
| 2.236 | 93.04 |
| 2.237 | 92.98 |
| 2.238 | 93.096 |
| 2.239 | 93.1 |
| 2.24 | 93.118 |
| 2.241 | 93.103 |
| 2.242 | 93.067 |
| 2.243 | 93.105 |
| 2.244 | 93.162 |
| 2.245 | 93.118 |
| 2.246 | 93.131 |
| 2.247 | 93.065 |
| 2.248 | 93.151 |
| 2.249 | 93.149 |
| 2.25 | 93.163 |
| 2.251 | 93.208 |
| 2.252 | 93.156 |
| 2.253 | 93.177 |
| 2.254 | 93.218 |
| 2.255 | 93.206 |
| 2.256 | 93.249 |
| 2.257 | 93.256 |
| 2.258 | 93.277 |
| 2.259 | 93.199 |
| 2.26 | 93.319 |
| 2.261 | 93.275 |
| 2.262 | 93.314 |
| 2.263 | 93.349 |
| 2.264 | 93.348 |
| 2.265 | 93.307 |
| 2.266 | 93.298 |
| 2.267 | 93.321 |
| 2.268 | 93.413 |
| 2.269 | 93.339 |
| 2.27 | 93.362 |
| 2.271 | 93.363 |
| 2.272 | 93.392 |
| 2.273 | 93.426 |
| 2.274 | 93.442 |
| 2.275 | 93.411 |
| 2.276 | 93.467 |
| 2.277 | 93.394 |
| 2.278 | 93.412 |
| 2.279 | 93.416 |
| 2.28 | 93.44 |
| 2.281 | 93.439 |
| 2.282 | 93.414 |
| 2.283 | 93.448 |
| 2.284 | 93.434 |
| 2.285 | 93.451 |
| 2.286 | 93.551 |
| 2.287 | 93.454 |
| 2.288 | 93.541 |
| 2.289 | 93.571 |
| 2.29 | 93.495 |
| 2.291 | 93.478 |
| 2.292 | 93.576 |
| 2.293 | 93.511 |
| 2.294 | 93.527 |
| 2.295 | 93.566 |
| 2.296 | 93.54 |
| 2.297 | 93.566 |
| 2.298 | 93.587 |
| 2.299 | 93.581 |
| 2.3 | 93.623 |
| 2.301 | 93.629 |
| 2.302 | 93.599 |
| 2.303 | 93.568 |
| 2.304 | 93.652 |
| 2.305 | 93.639 |
| 2.306 | 93.603 |
| 2.307 | 93.626 |
| 2.308 | 93.642 |
| 2.309 | 93.663 |
| 2.31 | 93.664 |
| 2.311 | 93.631 |
| 2.312 | 93.679 |
| 2.313 | 93.65 |
| 2.314 | 93.688 |
| 2.315 | 93.694 |
| 2.316 | 93.677 |
| 2.317 | 93.647 |
| 2.318 | 93.717 |
| 2.319 | 93.744 |
| 2.32 | 93.668 |
| 2.321 | 93.725 |
| 2.322 | 93.712 |
| 2.323 | 93.736 |
| 2.324 | 93.739 |
| 2.325 | 93.768 |
| 2.326 | 93.777 |
| 2.327 | 93.774 |
| 2.328 | 93.774 |
| 2.329 | 93.774 |
| 2.33 | 93.77 |
| 2.331 | 93.8 |
| 2.332 | 93.808 |
| 2.333 | 93.785 |
| 2.334 | 93.729 |
| 2.335 | 93.791 |
| 2.336 | 93.797 |
| 2.337 | 93.747 |
| 2.338 | 93.802 |
| 2.339 | 93.821 |
| 2.34 | 93.755 |
| 2.341 | 93.845 |
| 2.342 | 93.783 |
| 2.343 | 93.787 |
| 2.344 | 93.82 |
| 2.345 | 93.849 |
| 2.346 | 93.845 |
| 2.347 | 93.86 |
| 2.348 | 93.854 |
| 2.349 | 93.849 |
| 2.35 | 93.832 |
| 2.351 | 93.838 |
| 2.352 | 93.815 |
| 2.353 | 93.888 |
| 2.354 | 93.819 |
| 2.355 | 93.839 |
| 2.356 | 93.849 |
| 2.357 | 93.834 |
| 2.358 | 93.874 |
| 2.359 | 93.878 |
| 2.36 | 93.88 |
| 2.361 | 93.886 |
| 2.362 | 93.887 |
| 2.363 | 93.907 |
| 2.364 | 93.864 |
| 2.365 | 93.868 |
| 2.366 | 93.922 |
| 2.367 | 93.967 |
| 2.368 | 93.91 |
| 2.369 | 93.888 |
| 2.37 | 93.843 |
| 2.371 | 93.888 |
| 2.372 | 93.859 |
| 2.373 | 93.891 |
| 2.374 | 93.908 |
| 2.375 | 93.887 |
| 2.376 | 93.93 |
| 2.377 | 93.88 |
| 2.378 | 93.907 |
| 2.379 | 93.915 |
| 2.38 | 93.89 |
| 2.381 | 93.897 |
| 2.382 | 93.839 |
| 2.383 | 93.903 |
| 2.384 | 93.882 |
| 2.385 | 93.904 |
| 2.386 | 93.929 |
| 2.387 | 93.892 |
| 2.388 | 93.922 |
| 2.389 | 93.882 |
| 2.39 | 93.902 |
| 2.391 | 93.935 |
| 2.392 | 93.86 |
| 2.393 | 93.941 |
| 2.394 | 93.93 |
| 2.395 | 93.911 |
| 2.396 | 93.908 |
| 2.397 | 93.921 |
| 2.398 | 93.883 |
| 2.399 | 93.877 |
| 2.4 | 93.905 |
| 2.401 | 93.922 |
| 2.402 | 93.93 |
| 2.403 | 93.884 |
| 2.404 | 93.907 |
| 2.405 | 93.857 |
| 2.406 | 93.913 |
| 2.407 | 93.913 |
| 2.408 | 93.89 |
| 2.409 | 93.887 |
| 2.41 | 93.842 |
| 2.411 | 93.858 |
| 2.412 | 93.807 |
| 2.413 | 93.865 |
| 2.414 | 93.812 |
| 2.415 | 93.83 |
| 2.416 | 93.862 |
| 2.417 | 93.864 |
| 2.418 | 93.848 |
| 2.419 | 93.848 |
| 2.42 | 93.805 |
| 2.421 | 93.863 |
| 2.422 | 93.91 |
| 2.423 | 93.829 |
| 2.424 | 93.814 |
| 2.425 | 93.879 |
| 2.426 | 93.836 |
| 2.427 | 93.791 |
| 2.428 | 93.785 |
| 2.429 | 93.815 |
| 2.43 | 93.853 |
| 2.431 | 93.828 |
| 2.432 | 93.837 |
| 2.433 | 93.783 |
| 2.434 | 93.792 |
| 2.435 | 93.776 |
| 2.436 | 93.81 |
| 2.437 | 93.715 |
| 2.438 | 93.791 |
| 2.439 | 93.794 |
| 2.44 | 93.758 |
| 2.441 | 93.739 |
| 2.442 | 93.684 |
| 2.443 | 93.763 |
| 2.444 | 93.752 |
| 2.445 | 93.735 |
| 2.446 | 93.78 |
| 2.447 | 93.74 |
| 2.448 | 93.72 |
| 2.449 | 93.718 |
| 2.45 | 93.664 |
| 2.451 | 93.685 |
| 2.452 | 93.687 |
| 2.453 | 93.715 |
| 2.454 | 93.709 |
| 2.455 | 93.652 |
| 2.456 | 93.75 |
| 2.457 | 93.597 |
| 2.458 | 93.683 |
| 2.459 | 93.602 |
| 2.46 | 93.659 |
| 2.461 | 93.585 |
| 2.462 | 93.701 |
| 2.463 | 93.708 |
| 2.464 | 93.595 |
| 2.465 | 93.567 |
| 2.466 | 93.568 |
| 2.467 | 93.628 |
| 2.468 | 93.627 |
| 2.469 | 93.631 |
| 2.47 | 93.67 |
| 2.471 | 93.578 |
| 2.472 | 93.632 |
| 2.473 | 93.579 |
| 2.474 | 93.555 |
| 2.475 | 93.677 |
| 2.476 | 93.533 |
| 2.477 | 93.593 |
| 2.478 | 93.471 |
| 2.479 | 93.65 |
| 2.48 | 93.527 |
| 2.481 | 93.482 |
| 2.482 | 93.443 |
| 2.483 | 93.584 |
| 2.484 | 93.563 |
| 2.485 | 93.459 |
| 2.486 | 93.506 |
| 2.487 | 93.513 |
| 2.488 | 93.453 |
| 2.489 | 93.453 |
| 2.49 | 93.453 |
| 2.491 | 93.54 |
| 2.492 | 93.438 |
| 2.493 | 93.464 |
| 2.494 | 93.315 |
| 2.495 | 93.419 |
| 2.496 | 93.357 |
| 2.497 | 93.337 |
| 2.498 | 93.429 |
| 2.499 | 93.471 |
| 2.5 | 93.479 |
| 2.50167 | 93.48 |
| 2.50939 | 93.405 |
| 2.51711 | 93.339 |
| 2.52484 | 93.276 |
| 2.53256 | 93.225 |
| 2.54028 | 93.15 |
| 2.548 | 93.083 |
| 2.55572 | 92.943 |
| 2.56344 | 92.955 |
| 2.57116 | 92.889 |
| 2.57888 | 92.796 |
| 2.58661 | 92.782 |
| 2.59433 | 92.892 |
| 2.60205 | 92.698 |
| 2.60977 | 92.512 |
| 2.61749 | 92.612 |
| 2.62521 | 92.492 |
| 2.63293 | 92.344 |
| 2.64065 | 92.3 |
| 2.64838 | 92.173 |
| 2.6561 | 92.179 |
| 2.66382 | 92.332 |
| 2.67154 | 92.102 |
| 2.67926 | 91.98 |
| 2.68698 | 91.938 |
| 2.6947 | 91.963 |
| 2.70242 | 91.761 |
| 2.71015 | 91.738 |
| 2.71787 | 91.67 |
| 2.72559 | 91.384 |
| 2.73331 | 91.298 |
| 2.74103 | 91.127 |
| 2.74875 | 90.754 |
| 2.75647 | 90.368 |
| 2.76419 | 89.998 |
| 2.77191 | 89.442 |
| 2.77964 | 88.997 |
| 2.78736 | 88.561 |
| 2.79508 | 88.098 |
| 2.8028 | 87.852 |
| 2.81052 | 87.382 |
| 2.81824 | 87.14 |
| 2.82596 | 86.852 |
| 2.83368 | 86.7 |
| 2.84141 | 86.471 |
| 2.84913 | 86.379 |
| 2.85685 | 86.248 |
| 2.86457 | 86.198 |
| 2.87229 | 86.167 |
| 2.88001 | 86.146 |
| 2.88773 | 86.147 |
| 2.89545 | 86.164 |
| 2.90318 | 86.194 |
| 2.9109 | 86.222 |
| 2.91862 | 86.289 |
| 2.92634 | 86.353 |
| 2.93406 | 86.44 |
| 2.94178 | 86.544 |
| 2.9495 | 86.666 |
| 2.95722 | 86.812 |
| 2.96495 | 86.948 |
| 2.97267 | 87.087 |
| 2.98039 | 87.247 |
| 2.98811 | 87.392 |
| 2.99583 | 87.568 |
| 3.00355 | 87.758 |
| 3.01127 | 87.929 |
| 3.01899 | 88.097 |
| 3.02671 | 88.241 |
| 3.03444 | 88.392 |
| 3.04216 | 88.54 |
| 3.04988 | 88.693 |
| 3.0576 | 88.822 |
| 3.06532 | 88.975 |
| 3.07304 | 89.103 |
| 3.08076 | 89.226 |
| 3.08848 | 89.341 |
| 3.09621 | 89.447 |
| 3.10393 | 89.576 |
| 3.11165 | 89.702 |
| 3.11937 | 89.84 |
| 3.12709 | 89.996 |
| 3.13481 | 90.138 |
| 3.14253 | 90.288 |
| 3.15025 | 90.426 |
| 3.15798 | 90.556 |
| 3.1657 | 90.684 |
| 3.17342 | 90.798 |
| 3.18114 | 90.942 |
| 3.18886 | 91.068 |
| 3.19658 | 91.196 |
| 3.2043 | 91.31 |
| 3.21202 | 91.419 |
| 3.21975 | 91.525 |
| 3.22747 | 91.619 |
| 3.23519 | 91.7 |
| 3.24291 | 91.789 |
| 3.25063 | 91.871 |
| 3.25835 | 91.972 |
| 3.26607 | 92.058 |
| 3.27379 | 92.131 |
| 3.28151 | 92.206 |
| 3.28924 | 92.264 |
| 3.29696 | 92.331 |
| 3.30468 | 92.378 |
| 3.3124 | 92.425 |
| 3.32012 | 92.459 |
| 3.32784 | 92.506 |
| 3.33556 | 92.531 |
| 3.34328 | 92.542 |
| 3.35101 | 92.549 |
| 3.35873 | 92.555 |
| 3.36645 | 92.556 |
| 3.37417 | 92.516 |
| 3.38189 | 92.511 |
| 3.38961 | 92.54 |
| 3.39733 | 92.517 |
| 3.40505 | 92.444 |
| 3.41278 | 92.33 |
| 3.4205 | 92.262 |
| 3.42822 | 92.326 |
| 3.43594 | 92.471 |
| 3.44366 | 92.554 |
| 3.45138 | 92.595 |
| 3.4591 | 92.631 |
| 3.46682 | 92.642 |
| 3.47455 | 92.635 |
| 3.48227 | 92.594 |
| 3.48999 | 92.564 |
| 3.49771 | 92.484 |
| 3.50543 | 92.405 |
| 3.51315 | 92.465 |
| 3.52087 | 92.553 |
| 3.52859 | 92.586 |
| 3.53631 | 92.601 |
| 3.54404 | 92.594 |
| 3.55176 | 92.582 |
| 3.55948 | 92.567 |
| 3.5672 | 92.542 |
| 3.57492 | 92.506 |
| 3.58264 | 92.472 |
| 3.59036 | 92.444 |
| 3.59808 | 92.419 |
| 3.60581 | 92.376 |
| 3.61353 | 92.363 |
| 3.62125 | 92.346 |
| 3.62897 | 92.321 |
| 3.63669 | 92.3 |
| 3.64441 | 92.277 |
| 3.65213 | 92.243 |
| 3.65985 | 92.212 |
| 3.66758 | 92.169 |
| 3.6753 | 92.136 |
| 3.68302 | 92.108 |
| 3.69074 | 92.073 |
| 3.69846 | 92.036 |
| 3.70618 | 92.013 |
| 3.7139 | 91.988 |
| 3.72162 | 91.965 |
| 3.72935 | 91.933 |
| 3.73707 | 91.908 |
| 3.74479 | 91.883 |
| 3.75251 | 91.856 |
| 3.76023 | 91.828 |
| 3.76795 | 91.8 |
| 3.77567 | 91.771 |
| 3.78339 | 91.748 |
| 3.79111 | 91.72 |
| 3.79884 | 91.706 |
| 3.80656 | 91.687 |
| 3.81428 | 91.674 |
| 3.822 | 91.666 |
| 3.82972 | 91.656 |
| 3.83744 | 91.644 |
| 3.84516 | 91.628 |
| 3.85288 | 91.613 |
| 3.86061 | 91.603 |
| 3.86833 | 91.581 |
| 3.87605 | 91.563 |
| 3.88377 | 91.55 |
| 3.89149 | 91.536 |
| 3.89921 | 91.523 |
| 3.90693 | 91.514 |
| 3.91465 | 91.508 |
| 3.92238 | 91.5 |
| 3.9301 | 91.496 |
| 3.93782 | 91.493 |
| 3.94554 | 91.49 |
| 3.95326 | 91.491 |
| 3.96098 | 91.49 |
| 3.9687 | 91.477 |
| 3.97642 | 91.467 |
| 3.98415 | 91.457 |
| 3.99187 | 91.449 |
| 3.99959 | 91.446 |
| 4.00731 | 91.443 |
| 4.01503 | 91.437 |
| 4.02275 | 91.441 |
| 4.03047 | 91.453 |
| 4.03819 | 91.46 |
| 4.04591 | 91.465 |
| 4.05364 | 91.477 |
| 4.06136 | 91.489 |
| 4.06908 | 91.5 |
| 4.0768 | 91.507 |
| 4.08452 | 91.511 |
| 4.09224 | 91.512 |
| 4.09996 | 91.511 |
| 4.10768 | 91.506 |
| 4.11541 | 91.498 |
| 4.12313 | 91.502 |
| 4.13085 | 91.506 |
| 4.13857 | 91.521 |
| 4.14629 | 91.533 |
| 4.15401 | 91.553 |
| 4.16173 | 91.579 |
| 4.16945 | 91.61 |
| 4.17718 | 91.631 |
| 4.1849 | 91.654 |
| 4.19262 | 91.663 |
| 4.20034 | 91.662 |
| 4.20806 | 91.641 |
| 4.21578 | 91.601 |
| 4.2235 | 91.542 |
| 4.23122 | 91.47 |
| 4.23895 | 91.384 |
| 4.24667 | 91.346 |
| 4.25439 | 91.454 |
| 4.26211 | 91.606 |
| 4.26983 | 91.567 |
| 4.27755 | 91.554 |
| 4.28527 | 91.589 |
| 4.29299 | 91.642 |
| 4.30071 | 91.676 |
| 4.30844 | 91.702 |
| 4.31616 | 91.758 |
| 4.32388 | 91.821 |
| 4.3316 | 91.867 |
| 4.33932 | 91.91 |
| 4.34704 | 91.943 |
| 4.35476 | 91.977 |
| 4.36248 | 92.006 |
| 4.37021 | 92.025 |
| 4.37793 | 92.05 |
| 4.38565 | 92.07 |
| 4.39337 | 92.069 |
| 4.40109 | 92.098 |
| 4.40881 | 92.142 |
| 4.41653 | 92.168 |
| 4.42425 | 92.196 |
| 4.43198 | 92.233 |
| 4.4397 | 92.269 |
| 4.44742 | 92.302 |
| 4.45514 | 92.33 |
| 4.46286 | 92.359 |
| 4.47058 | 92.382 |
| 4.4783 | 92.408 |
| 4.48602 | 92.436 |
| 4.49375 | 92.451 |
| 4.50147 | 92.464 |
| 4.50919 | 92.484 |
| 4.51691 | 92.495 |
| 4.52463 | 92.515 |
| 4.53235 | 92.543 |
| 4.54007 | 92.566 |
| 4.54779 | 92.591 |
| 4.55551 | 92.618 |
| 4.56324 | 92.642 |
| 4.57096 | 92.672 |
| 4.57868 | 92.703 |
| 4.5864 | 92.734 |
| 4.59412 | 92.761 |
| 4.60184 | 92.787 |
| 4.60956 | 92.816 |
| 4.61728 | 92.841 |
| 4.62501 | 92.861 |
| 4.63273 | 92.888 |
| 4.64045 | 92.912 |
| 4.64817 | 92.937 |
| 4.65589 | 92.964 |
| 4.66361 | 92.987 |
| 4.67133 | 93.009 |
| 4.67905 | 93.032 |
| 4.68678 | 93.055 |
| 4.6945 | 93.076 |
| 4.70222 | 93.096 |
| 4.70994 | 93.114 |
| 4.71766 | 93.142 |
| 4.72538 | 93.173 |
| 4.7331 | 93.203 |
| 4.74082 | 93.234 |
| 4.74855 | 93.266 |
| 4.75627 | 93.293 |
| 4.76399 | 93.324 |
| 4.77171 | 93.357 |
| 4.77943 | 93.384 |
| 4.78715 | 93.403 |
| 4.79487 | 93.426 |
| 4.80259 | 93.45 |
| 4.81031 | 93.47 |
| 4.81804 | 93.486 |
| 4.82576 | 93.502 |
| 4.83348 | 93.519 |
| 4.8412 | 93.535 |
| 4.84892 | 93.548 |
| 4.85664 | 93.563 |
| 4.86436 | 93.575 |
| 4.87208 | 93.589 |
| 4.87981 | 93.606 |
| 4.88753 | 93.626 |
| 4.89525 | 93.646 |
| 4.90297 | 93.659 |
| 4.91069 | 93.677 |
| 4.91841 | 93.701 |
| 4.92613 | 93.725 |
| 4.93385 | 93.744 |
| 4.94158 | 93.765 |
| 4.9493 | 93.789 |
| 4.95702 | 93.808 |
| 4.96474 | 93.816 |
| 4.97246 | 93.834 |
| 4.98018 | 93.848 |
| 4.9879 | 93.858 |
| 4.99562 | 93.869 |
| 5.00335 | 93.878 |
| 5.01107 | 93.892 |
| 5.01879 | 93.898 |
| 5.02651 | 93.886 |
| 5.03423 | 93.885 |
| 5.04195 | 93.891 |
| 5.04967 | 93.898 |
| 5.05739 | 93.904 |
| 5.06511 | 93.911 |
| 5.07284 | 93.929 |
| 5.08056 | 93.945 |
| 5.08828 | 93.941 |
| 5.096 | 93.948 |
| 5.10372 | 93.963 |
| 5.11144 | 93.975 |
| 5.11916 | 93.982 |
| 5.12688 | 93.995 |
| 5.13461 | 94.019 |
| 5.14233 | 94.039 |
| 5.15005 | 94.024 |
| 5.15777 | 94.013 |
| 5.16549 | 94.023 |
| 5.17321 | 94.029 |
| 5.18093 | 94.032 |
| 5.18865 | 94.042 |
| 5.19638 | 94.052 |
| 5.2041 | 94.044 |
| 5.21182 | 94.034 |
| 5.21954 | 94.017 |
| 5.22726 | 94.027 |
| 5.23498 | 94.038 |
| 5.2427 | 94.022 |
| 5.25042 | 94.01 |
| 5.25814 | 94.011 |
| 5.26587 | 94.019 |
| 5.27359 | 94.026 |
| 5.28131 | 94.03 |
| 5.28903 | 94.035 |
| 5.29675 | 94.02 |
| 5.30447 | 94.013 |
| 5.31219 | 94.014 |
| 5.31991 | 94.013 |
| 5.32764 | 94.016 |
| 5.33536 | 94.032 |
| 5.34308 | 94.067 |
| 5.3508 | 94.062 |
| 5.35852 | 93.998 |
| 5.36624 | 93.98 |
| 5.37396 | 93.986 |
| 5.38168 | 93.983 |
| 5.38941 | 93.977 |
| 5.39713 | 93.975 |
| 5.40485 | 93.988 |
| 5.41257 | 94.015 |
| 5.42029 | 93.998 |
| 5.42801 | 93.936 |
| 5.43573 | 93.923 |
| 5.44345 | 93.933 |
| 5.45118 | 93.943 |
| 5.4589 | 93.971 |
| 5.46662 | 93.958 |
| 5.47434 | 93.919 |
| 5.48206 | 93.889 |
| 5.48978 | 93.874 |
| 5.4975 | 93.876 |
| 5.50522 | 93.878 |
| 5.51294 | 93.888 |
| 5.52067 | 93.884 |
| 5.52839 | 93.854 |
| 5.53611 | 93.846 |
| 5.54383 | 93.861 |
| 5.55155 | 93.861 |
| 5.55927 | 93.843 |
| 5.56699 | 93.856 |
| 5.57471 | 93.866 |
| 5.58244 | 93.804 |
| 5.59016 | 93.756 |
| 5.59788 | 93.764 |
| 5.6056 | 93.771 |
| 5.61332 | 93.76 |
| 5.62104 | 93.749 |
| 5.62876 | 93.773 |
| 5.63648 | 93.812 |
| 5.64421 | 93.762 |
| 5.65193 | 93.679 |
| 5.65965 | 93.658 |
| 5.66737 | 93.685 |
| 5.67509 | 93.693 |
| 5.68281 | 93.67 |
| 5.69053 | 93.649 |
| 5.69825 | 93.65 |
| 5.70598 | 93.68 |
| 5.7137 | 93.67 |
| 5.72142 | 93.601 |
| 5.72914 | 93.547 |
| 5.73686 | 93.521 |
| 5.74458 | 93.484 |
| 5.7523 | 93.452 |
| 5.76002 | 93.437 |
| 5.76774 | 93.344 |
| 5.77547 | 93.183 |
| 5.78319 | 93.113 |
| 5.79091 | 93.1 |
| 5.79863 | 93.103 |
| 5.80635 | 93.123 |
| 5.81407 | 93.17 |
| 5.82179 | 93.154 |
| 5.82951 | 93.027 |
| 5.83724 | 92.948 |
| 5.84496 | 92.957 |
| 5.85268 | 92.991 |
| 5.8604 | 92.996 |
| 5.86812 | 92.979 |
| 5.87584 | 92.97 |
| 5.88356 | 92.918 |
| 5.89128 | 92.782 |
| 5.89901 | 92.632 |
| 5.90673 | 92.567 |
| 5.91445 | 92.56 |
| 5.92217 | 92.559 |
| 5.92989 | 92.531 |
| 5.93761 | 92.382 |
| 5.94533 | 92.174 |
| 5.95305 | 92.091 |
| 5.96078 | 92.076 |
| 5.9685 | 92.031 |
| 5.97622 | 91.962 |
| 5.98394 | 91.87 |
| 5.99166 | 91.722 |
| 5.99938 | 91.598 |
| 6.0071 | 91.535 |
| 6.01482 | 91.438 |
| 6.02254 | 91.31 |
| 6.03027 | 91.26 |
| 6.03799 | 91.261 |
| 6.04571 | 91.16 |
| 6.05343 | 90.908 |
| 6.06115 | 90.751 |
| 6.06887 | 90.643 |
| 6.07659 | 90.446 |
| 6.08431 | 90.294 |
| 6.09204 | 90.242 |
| 6.09976 | 90.224 |
| 6.10748 | 90.148 |
| 6.1152 | 89.91 |
| 6.12292 | 89.711 |
| 6.13064 | 89.662 |
| 6.13836 | 89.65 |
| 6.14608 | 89.627 |
| 6.15381 | 89.596 |
| 6.16153 | 89.57 |
| 6.16925 | 89.579 |
| 6.17697 | 89.64 |
| 6.18469 | 89.72 |
| 6.19241 | 89.809 |
| 6.20013 | 89.935 |
| 6.20785 | 90.099 |
| 6.21558 | 90.276 |
| 6.2233 | 90.444 |
| 6.23102 | 90.597 |
| 6.23874 | 90.733 |
| 6.24646 | 90.852 |
| 6.25418 | 90.961 |
| 6.2619 | 91.062 |
| 6.26962 | 91.145 |
| 6.27734 | 91.204 |
| 6.28507 | 91.247 |
| 6.29279 | 91.282 |
| 6.30051 | 91.315 |
| 6.30823 | 91.35 |
| 6.31595 | 91.393 |
| 6.32367 | 91.456 |
| 6.33139 | 91.543 |
| 6.33911 | 91.623 |
| 6.34684 | 91.665 |
| 6.35456 | 91.71 |
| 6.36228 | 91.782 |
| 6.37 | 91.833 |
| 6.37772 | 91.844 |
| 6.38544 | 91.864 |
| 6.39316 | 91.917 |
| 6.40088 | 92 |
| 6.40861 | 92.073 |
| 6.41633 | 92.031 |
| 6.42405 | 91.937 |
| 6.43177 | 91.916 |
| 6.43949 | 91.936 |
| 6.44721 | 91.961 |
| 6.45493 | 91.992 |
| 6.46265 | 92.044 |
| 6.47038 | 92.126 |
| 6.4781 | 92.219 |
| 6.48582 | 92.246 |
| 6.49354 | 92.167 |
| 6.50126 | 92.083 |
| 6.50898 | 92.09 |
| 6.5167 | 92.133 |
| 6.52442 | 92.164 |
| 6.53214 | 92.193 |
| 6.53987 | 92.245 |
| 6.54759 | 92.312 |
| 6.55531 | 92.376 |
| 6.56303 | 92.426 |
| 6.57075 | 92.441 |
| 6.57847 | 92.43 |
| 6.58619 | 92.416 |
| 6.59391 | 92.409 |
| 6.60164 | 92.418 |
| 6.60936 | 92.456 |
| 6.61708 | 92.522 |
| 6.6248 | 92.586 |
| 6.63252 | 92.586 |
| 6.64024 | 92.482 |
| 6.64796 | 92.432 |
| 6.65568 | 92.478 |
| 6.66341 | 92.538 |
| 6.67113 | 92.568 |
| 6.67885 | 92.553 |
| 6.68657 | 92.53 |
| 6.69429 | 92.536 |
| 6.70201 | 92.566 |
| 6.70973 | 92.576 |
| 6.71745 | 92.531 |
| 6.72518 | 92.472 |
| 6.7329 | 92.456 |
| 6.74062 | 92.457 |
| 6.74834 | 92.459 |
| 6.75606 | 92.462 |
| 6.76378 | 92.477 |
| 6.7715 | 92.501 |
| 6.77922 | 92.515 |
| 6.78694 | 92.471 |
| 6.79467 | 92.381 |
| 6.80239 | 92.336 |
| 6.81011 | 92.336 |
| 6.81783 | 92.348 |
| 6.82555 | 92.35 |
| 6.83327 | 92.346 |
| 6.84099 | 92.366 |
| 6.84871 | 92.419 |
| 6.85644 | 92.436 |
| 6.86416 | 92.381 |
| 6.87188 | 92.31 |
| 6.8796 | 92.277 |
| 6.88732 | 92.293 |
| 6.89504 | 92.315 |
| 6.90276 | 92.318 |
| 6.91048 | 92.311 |
| 6.91821 | 92.31 |
| 6.92593 | 92.324 |
| 6.93365 | 92.356 |
| 6.94137 | 92.4 |
| 6.94909 | 92.443 |
| 6.95681 | 92.463 |
| 6.96453 | 92.466 |
| 6.97225 | 92.467 |
| 6.97998 | 92.486 |
| 6.9877 | 92.513 |
| 6.99542 | 92.528 |
| 7.00314 | 92.542 |
| 7.01086 | 92.56 |
| 7.01858 | 92.583 |
| 7.0263 | 92.609 |
| 7.03402 | 92.636 |
| 7.04174 | 92.644 |
| 7.04947 | 92.631 |
| 7.05719 | 92.606 |
| 7.06491 | 92.594 |
| 7.07263 | 92.606 |
| 7.08035 | 92.62 |
| 7.08807 | 92.635 |
| 7.09579 | 92.655 |
| 7.10351 | 92.681 |
| 7.11124 | 92.707 |
| 7.11896 | 92.73 |
| 7.12668 | 92.754 |
| 7.1344 | 92.783 |
| 7.14212 | 92.816 |
| 7.14984 | 92.84 |
| 7.15756 | 92.852 |
| 7.16528 | 92.858 |
| 7.17301 | 92.863 |
| 7.18073 | 92.882 |
| 7.18845 | 92.917 |
| 7.19617 | 92.953 |
| 7.20389 | 92.982 |
| 7.21161 | 92.994 |
| 7.21933 | 93.003 |
| 7.22705 | 93.023 |
| 7.23478 | 93.051 |
| 7.2425 | 93.084 |
| 7.25022 | 93.115 |
| 7.25794 | 93.143 |
| 7.26566 | 93.165 |
| 7.27338 | 93.18 |
| 7.2811 | 93.183 |
| 7.28882 | 93.19 |
| 7.29654 | 93.204 |
| 7.30427 | 93.228 |
| 7.31199 | 93.261 |
| 7.31971 | 93.299 |
| 7.32743 | 93.335 |
| 7.33515 | 93.364 |
| 7.34287 | 93.378 |
| 7.35059 | 93.39 |
| 7.35831 | 93.404 |
| 7.36604 | 93.423 |
| 7.37376 | 93.442 |
| 7.38148 | 93.459 |
| 7.3892 | 93.474 |
| 7.39692 | 93.487 |
| 7.40464 | 93.496 |
| 7.41236 | 93.504 |
| 7.42008 | 93.511 |
| 7.42781 | 93.52 |
| 7.43553 | 93.535 |
| 7.44325 | 93.553 |
| 7.45097 | 93.572 |
| 7.45869 | 93.581 |
| 7.46641 | 93.578 |
| 7.47413 | 93.572 |
| 7.48185 | 93.568 |
| 7.48958 | 93.576 |
| 7.4973 | 93.589 |
| 7.50502 | 93.603 |
| 7.51274 | 93.616 |
| 7.52046 | 93.628 |
| 7.52818 | 93.639 |
| 7.5359 | 93.652 |
| 7.54362 | 93.666 |
| 7.55134 | 93.682 |
| 7.55907 | 93.701 |
| 7.56679 | 93.719 |
| 7.57451 | 93.734 |
| 7.58223 | 93.747 |
| 7.58995 | 93.755 |
| 7.59767 | 93.762 |
| 7.60539 | 93.768 |
| 7.61311 | 93.774 |
| 7.62084 | 93.778 |
| 7.62856 | 93.783 |
| 7.63628 | 93.788 |
| 7.644 | 93.794 |
| 7.65172 | 93.8 |
| 7.65944 | 93.806 |
| 7.66716 | 93.813 |
| 7.67488 | 93.822 |
| 7.68261 | 93.832 |
| 7.69033 | 93.845 |
| 7.69805 | 93.859 |
| 7.70577 | 93.874 |
| 7.71349 | 93.889 |
| 7.72121 | 93.905 |
| 7.72893 | 93.92 |
| 7.73665 | 93.935 |
| 7.74438 | 93.95 |
| 7.7521 | 93.964 |
| 7.75982 | 93.98 |
| 7.76754 | 93.996 |
| 7.77526 | 94.014 |
| 7.78298 | 94.035 |
| 7.7907 | 94.059 |
| 7.79842 | 94.084 |
| 7.80614 | 94.111 |
| 7.81387 | 94.137 |
| 7.82159 | 94.162 |
| 7.82931 | 94.187 |
| 7.83703 | 94.211 |
| 7.84475 | 94.234 |
| 7.85247 | 94.256 |
| 7.86019 | 94.275 |
| 7.86791 | 94.294 |
| 7.87564 | 94.312 |
| 7.88336 | 94.329 |
| 7.89108 | 94.347 |
| 7.8988 | 94.365 |
| 7.90652 | 94.383 |
| 7.91424 | 94.4 |
| 7.92196 | 94.416 |
| 7.92968 | 94.43 |
| 7.93741 | 94.44 |
| 7.94513 | 94.447 |
| 7.95285 | 94.452 |
| 7.96057 | 94.456 |
| 7.96829 | 94.462 |
| 7.97601 | 94.472 |
| 7.98373 | 94.488 |
| 7.99145 | 94.508 |
| 7.99918 | 94.533 |
| 8.0069 | 94.56 |
| 8.01462 | 94.588 |
| 8.02234 | 94.615 |
| 8.03006 | 94.64 |
| 8.03778 | 94.664 |
| 8.0455 | 94.686 |
| 8.05322 | 94.707 |
| 8.06094 | 94.73 |
| 8.06867 | 94.754 |
| 8.07639 | 94.78 |
| 8.08411 | 94.806 |
| 8.09183 | 94.83 |
| 8.09955 | 94.854 |
| 8.10727 | 94.876 |
| 8.11499 | 94.897 |
| 8.12271 | 94.918 |
| 8.13044 | 94.938 |
| 8.13816 | 94.959 |
| 8.14588 | 94.977 |
| 8.1536 | 94.995 |
| 8.16132 | 95.01 |
| 8.16904 | 95.024 |
| 8.17676 | 95.039 |
| 8.18448 | 95.057 |
| 8.19221 | 95.076 |
| 8.19993 | 95.098 |
| 8.20765 | 95.118 |
| 8.21537 | 95.137 |
| 8.22309 | 95.152 |
| 8.23081 | 95.165 |
| 8.23853 | 95.176 |
| 8.24625 | 95.188 |
| 8.25398 | 95.201 |
| 8.2617 | 95.215 |
| 8.26942 | 95.229 |
| 8.27714 | 95.244 |
| 8.28486 | 95.259 |
| 8.29258 | 95.271 |
| 8.3003 | 95.282 |
| 8.30802 | 95.292 |
| 8.31574 | 95.302 |
| 8.32347 | 95.312 |
| 8.33119 | 95.321 |
| 8.33891 | 95.329 |
| 8.34663 | 95.337 |
| 8.35435 | 95.344 |
| 8.36207 | 95.352 |
| 8.36979 | 95.36 |
| 8.37751 | 95.368 |
| 8.38524 | 95.376 |
| 8.39296 | 95.384 |
| 8.40068 | 95.39 |
| 8.4084 | 95.399 |
| 8.41612 | 95.409 |
| 8.42384 | 95.422 |
| 8.43156 | 95.436 |
| 8.43928 | 95.45 |
| 8.44701 | 95.463 |
| 8.45473 | 95.472 |
| 8.46245 | 95.478 |
| 8.47017 | 95.482 |
| 8.47789 | 95.487 |
| 8.48561 | 95.491 |
| 8.49333 | 95.498 |
| 8.50105 | 95.506 |
| 8.50878 | 95.516 |
| 8.5165 | 95.527 |
| 8.52422 | 95.54 |
| 8.53194 | 95.553 |
| 8.53966 | 95.568 |
| 8.54738 | 95.584 |
| 8.5551 | 95.599 |
| 8.56282 | 95.614 |
| 8.57054 | 95.628 |
| 8.57827 | 95.64 |
| 8.58599 | 95.653 |
| 8.59371 | 95.664 |
| 8.60143 | 95.676 |
| 8.60915 | 95.687 |
| 8.61687 | 95.698 |
| 8.62459 | 95.708 |
| 8.63231 | 95.718 |
| 8.64004 | 95.728 |
| 8.64776 | 95.737 |
| 8.65548 | 95.746 |
| 8.6632 | 95.754 |
| 8.67092 | 95.763 |
| 8.67864 | 95.774 |
| 8.68636 | 95.784 |
| 8.69408 | 95.793 |
| 8.70181 | 95.802 |
| 8.70953 | 95.808 |
| 8.71725 | 95.814 |
| 8.72497 | 95.818 |
| 8.73269 | 95.823 |
| 8.74041 | 95.829 |
| 8.74813 | 95.836 |
| 8.75585 | 95.843 |
| 8.76357 | 95.85 |
| 8.7713 | 95.858 |
| 8.77902 | 95.864 |
| 8.78674 | 95.87 |
| 8.79446 | 95.874 |
| 8.80218 | 95.877 |
| 8.8099 | 95.881 |
| 8.81762 | 95.885 |
| 8.82534 | 95.892 |
| 8.83307 | 95.9 |
| 8.84079 | 95.907 |
| 8.84851 | 95.914 |
| 8.85623 | 95.916 |
| 8.86395 | 95.917 |
| 8.87167 | 95.914 |
| 8.87939 | 95.912 |
| 8.88711 | 95.91 |
| 8.89484 | 95.909 |
| 8.90256 | 95.909 |
| 8.91028 | 95.909 |
| 8.918 | 95.909 |
| 8.92572 | 95.908 |
| 8.93344 | 95.907 |
| 8.94116 | 95.907 |
| 8.94888 | 95.907 |
| 8.95661 | 95.908 |
| 8.96433 | 95.911 |
| 8.97205 | 95.914 |
| 8.97977 | 95.917 |
| 8.98749 | 95.921 |
| 8.99521 | 95.925 |
| 9.00293 | 95.93 |
| 9.01065 | 95.936 |
| 9.01837 | 95.941 |
| 9.0261 | 95.944 |
| 9.03382 | 95.947 |
| 9.04154 | 95.947 |
| 9.04926 | 95.946 |
| 9.05698 | 95.945 |
| 9.0647 | 95.944 |
| 9.07242 | 95.944 |
| 9.08014 | 95.943 |
| 9.08787 | 95.942 |
| 9.09559 | 95.941 |
| 9.10331 | 95.939 |
| 9.11103 | 95.938 |
| 9.11875 | 95.936 |
| 9.12647 | 95.935 |
| 9.13419 | 95.936 |
| 9.14191 | 95.938 |
| 9.14964 | 95.94 |
| 9.15736 | 95.944 |
| 9.16508 | 95.947 |
| 9.1728 | 95.95 |
| 9.18052 | 95.953 |
| 9.18824 | 95.955 |
| 9.19596 | 95.958 |
| 9.20368 | 95.96 |
| 9.21141 | 95.962 |
| 9.21913 | 95.964 |
| 9.22685 | 95.966 |
| 9.23457 | 95.965 |
| 9.24229 | 95.965 |
| 9.25001 | 95.962 |
| 9.25773 | 95.959 |
| 9.26545 | 95.956 |
| 9.27317 | 95.953 |
| 9.2809 | 95.952 |
| 9.28862 | 95.953 |
| 9.29634 | 95.956 |
| 9.30406 | 95.963 |
| 9.31178 | 95.972 |
| 9.3195 | 95.984 |
| 9.32722 | 95.997 |
| 9.33494 | 96.013 |
| 9.34267 | 96.028 |
| 9.35039 | 96.041 |
| 9.35811 | 96.055 |
| 9.36583 | 96.064 |
| 9.37355 | 96.073 |
| 9.38127 | 96.08 |
| 9.38899 | 96.085 |
| 9.39671 | 96.09 |
| 9.40444 | 96.096 |
| 9.41216 | 96.101 |
| 9.41988 | 96.107 |
| 9.4276 | 96.112 |
| 9.43532 | 96.118 |
| 9.44304 | 96.125 |
| 9.45076 | 96.131 |
| 9.45848 | 96.138 |
| 9.46621 | 96.146 |
| 9.47393 | 96.154 |
| 9.48165 | 96.161 |
| 9.48937 | 96.168 |
| 9.49709 | 96.176 |
| 9.50481 | 96.179 |
| 9.51253 | 96.183 |
| 9.52025 | 96.183 |
| 9.52797 | 96.182 |
| 9.5357 | 96.18 |
| 9.54342 | 96.178 |
| 9.55114 | 96.175 |
| 9.55886 | 96.174 |
| 9.56658 | 96.173 |
| 9.5743 | 96.175 |
| 9.58202 | 96.177 |
| 9.58974 | 96.181 |
| 9.59747 | 96.186 |
| 9.60519 | 96.191 |
| 9.61291 | 96.199 |
| 9.62063 | 96.207 |
| 9.62835 | 96.216 |
| 9.63607 | 96.226 |
| 9.64379 | 96.235 |
| 9.65151 | 96.245 |
| 9.65924 | 96.253 |
| 9.66696 | 96.26 |
| 9.67468 | 96.267 |
| 9.6824 | 96.271 |
| 9.69012 | 96.274 |
| 9.69784 | 96.276 |
| 9.70556 | 96.277 |
| 9.71328 | 96.278 |
| 9.72101 | 96.28 |
| 9.72873 | 96.281 |
| 9.73645 | 96.284 |
| 9.74417 | 96.287 |
| 9.75189 | 96.29 |
| 9.75961 | 96.294 |
| 9.76733 | 96.299 |
| 9.77505 | 96.301 |
| 9.78277 | 96.304 |
| 9.7905 | 96.306 |
| 9.79822 | 96.308 |
| 9.80594 | 96.31 |
| 9.81366 | 96.312 |
| 9.82138 | 96.314 |
| 9.8291 | 96.315 |
| 9.83682 | 96.316 |
| 9.84454 | 96.315 |
| 9.85227 | 96.315 |
| 9.85999 | 96.313 |
| 9.86771 | 96.309 |
| 9.87543 | 96.305 |
| 9.88315 | 96.299 |
| 9.89087 | 96.291 |
| 9.89859 | 96.284 |
| 9.90631 | 96.276 |
| 9.91404 | 96.268 |
| 9.92176 | 96.261 |
| 9.92948 | 96.255 |
| 9.9372 | 96.249 |
| 9.94492 | 96.245 |
| 9.95264 | 96.24 |
| 9.96036 | 96.235 |
| 9.96808 | 96.231 |
| 9.97581 | 96.226 |
| 9.98353 | 96.22 |
| 9.99125 | 96.214 |
| 9.99897 | 96.206 |
| 10.0067 | 96.198 |
| 10.0144 | 96.19 |
| 10.0221 | 96.181 |
| 10.0299 | 96.172 |
| 10.0376 | 96.165 |
| 10.0453 | 96.157 |
| 10.053 | 96.151 |
| 10.0607 | 96.145 |
| 10.0685 | 96.14 |
| 10.0762 | 96.134 |
| 10.0839 | 96.128 |
| 10.0916 | 96.121 |
| 10.0993 | 96.112 |
| 10.1071 | 96.104 |
| 10.1148 | 96.094 |
| 10.1225 | 96.084 |
| 10.1302 | 96.074 |
| 10.138 | 96.065 |
| 10.1457 | 96.056 |
| 10.1534 | 96.047 |
| 10.1611 | 96.038 |
| 10.1688 | 96.029 |
| 10.1766 | 96.017 |
| 10.1843 | 96.006 |
| 10.192 | 95.994 |
| 10.1997 | 95.982 |
| 10.2074 | 95.97 |
| 10.2152 | 95.96 |
| 10.2229 | 95.951 |
| 10.2306 | 95.942 |
| 10.2383 | 95.935 |
| 10.246 | 95.927 |
| 10.2538 | 95.917 |
| 10.2615 | 95.906 |
| 10.2692 | 95.895 |
| 10.2769 | 95.88 |
| 10.2847 | 95.865 |
| 10.2924 | 95.85 |
| 10.3001 | 95.834 |
| 10.3078 | 95.819 |
| 10.3155 | 95.804 |
| 10.3233 | 95.789 |
| 10.331 | 95.774 |
| 10.3387 | 95.758 |
| 10.3464 | 95.742 |
| 10.3541 | 95.726 |
| 10.3619 | 95.71 |
| 10.3696 | 95.694 |
| 10.3773 | 95.681 |
| 10.385 | 95.667 |
| 10.3928 | 95.654 |
| 10.4005 | 95.64 |
| 10.4082 | 95.626 |
| 10.4159 | 95.611 |
| 10.4236 | 95.594 |
| 10.4314 | 95.577 |
| 10.4391 | 95.559 |
| 10.4468 | 95.541 |
| 10.4545 | 95.523 |
| 10.4622 | 95.505 |
| 10.47 | 95.488 |
| 10.4777 | 95.47 |
| 10.4854 | 95.453 |
| 10.4931 | 95.436 |
| 10.5008 | 95.419 |
| 10.5086 | 95.402 |
| 10.5163 | 95.386 |
| 10.524 | 95.371 |
| 10.5317 | 95.357 |
| 10.5395 | 95.342 |
| 10.5472 | 95.329 |
| 10.5549 | 95.315 |
| 10.5626 | 95.301 |
| 10.5703 | 95.285 |
| 10.5781 | 95.268 |
| 10.5858 | 95.25 |
| 10.5935 | 95.229 |
| 10.6012 | 95.208 |
| 10.6089 | 95.185 |
| 10.6167 | 95.162 |
| 10.6244 | 95.138 |
| 10.6321 | 95.114 |
| 10.6398 | 95.091 |
| 10.6476 | 95.067 |
| 10.6553 | 95.045 |
| 10.663 | 95.023 |
| 10.6707 | 95.001 |
| 10.6784 | 94.981 |
| 10.6862 | 94.961 |
| 10.6939 | 94.942 |
| 10.7016 | 94.923 |
| 10.7093 | 94.905 |
| 10.717 | 94.887 |
| 10.7248 | 94.868 |
| 10.7325 | 94.85 |
| 10.7402 | 94.83 |
| 10.7479 | 94.809 |
| 10.7556 | 94.788 |
| 10.7634 | 94.766 |
| 10.7711 | 94.743 |
| 10.7788 | 94.72 |
| 10.7865 | 94.698 |
| 10.7943 | 94.676 |
| 10.802 | 94.654 |
| 10.8097 | 94.633 |
| 10.8174 | 94.611 |
| 10.8251 | 94.589 |
| 10.8329 | 94.566 |
| 10.8406 | 94.544 |
| 10.8483 | 94.521 |
| 10.856 | 94.498 |
| 10.8637 | 94.475 |
| 10.8715 | 94.453 |
| 10.8792 | 94.43 |
| 10.8869 | 94.408 |
| 10.8946 | 94.385 |
| 10.9024 | 94.361 |
| 10.9101 | 94.338 |
| 10.9178 | 94.314 |
| 10.9255 | 94.29 |
| 10.9332 | 94.266 |
| 10.941 | 94.243 |
| 10.9487 | 94.222 |
| 10.9564 | 94.2 |
| 10.9641 | 94.178 |
| 10.9718 | 94.157 |
| 10.9796 | 94.136 |
| 10.9873 | 94.114 |
| 10.995 | 94.091 |
| 11.0027 | 94.068 |
| 11.0104 | 94.045 |
| 11.0182 | 94.022 |
| 11.0259 | 93.998 |
| 11.0336 | 93.974 |
| 11.0413 | 93.952 |
| 11.0491 | 93.93 |
| 11.0568 | 93.908 |
| 11.0645 | 93.887 |
| 11.0722 | 93.866 |
| 11.0799 | 93.845 |
| 11.0877 | 93.823 |
| 11.0954 | 93.801 |
| 11.1031 | 93.779 |
| 11.1108 | 93.756 |
| 11.1185 | 93.734 |
| 11.1263 | 93.711 |
| 11.134 | 93.689 |
| 11.1417 | 93.668 |
| 11.1494 | 93.647 |
| 11.1572 | 93.626 |
| 11.1649 | 93.606 |
| 11.1726 | 93.586 |
| 11.1803 | 93.565 |
| 11.188 | 93.544 |
| 11.1958 | 93.523 |
| 11.2035 | 93.501 |
| 11.2112 | 93.478 |
| 11.2189 | 93.456 |
| 11.2266 | 93.433 |
| 11.2344 | 93.409 |
| 11.2421 | 93.386 |
| 11.2498 | 93.362 |
| 11.2575 | 93.338 |
| 11.2652 | 93.314 |
| 11.273 | 93.29 |
| 11.2807 | 93.267 |
| 11.2884 | 93.245 |
| 11.2961 | 93.222 |
| 11.3039 | 93.201 |
| 11.3116 | 93.18 |
| 11.3193 | 93.16 |
| 11.327 | 93.138 |
| 11.3347 | 93.116 |
| 11.3425 | 93.094 |
| 11.3502 | 93.07 |
| 11.3579 | 93.045 |
| 11.3656 | 93.02 |
| 11.3733 | 92.994 |
| 11.3811 | 92.967 |
| 11.3888 | 92.94 |
| 11.3965 | 92.914 |
| 11.4042 | 92.885 |
| 11.412 | 92.857 |
| 11.4197 | 92.829 |
| 11.4274 | 92.8 |
| 11.4351 | 92.771 |
| 11.4428 | 92.742 |
| 11.4506 | 92.712 |
| 11.4583 | 92.683 |
| 11.466 | 92.653 |
| 11.4737 | 92.624 |
| 11.4814 | 92.596 |
| 11.4892 | 92.567 |
| 11.4969 | 92.539 |
| 11.5046 | 92.512 |
| 11.5123 | 92.486 |
| 11.52 | 92.46 |
| 11.5278 | 92.436 |
| 11.5355 | 92.412 |
| 11.5432 | 92.389 |
| 11.5509 | 92.366 |
| 11.5587 | 92.344 |
| 11.5664 | 92.322 |
| 11.5741 | 92.3 |
| 11.5818 | 92.276 |
| 11.5895 | 92.253 |
| 11.5973 | 92.23 |
| 11.605 | 92.206 |
| 11.6127 | 92.182 |
| 11.6204 | 92.158 |
| 11.6281 | 92.134 |
| 11.6359 | 92.109 |
| 11.6436 | 92.084 |
| 11.6513 | 92.058 |
| 11.659 | 92.031 |
| 11.6668 | 92.003 |
| 11.6745 | 91.975 |
| 11.6822 | 91.946 |
| 11.6899 | 91.915 |
| 11.6976 | 91.884 |
| 11.7054 | 91.854 |
| 11.7131 | 91.823 |
| 11.7208 | 91.793 |
| 11.7285 | 91.763 |
| 11.7362 | 91.735 |
| 11.744 | 91.708 |
| 11.7517 | 91.681 |
| 11.7594 | 91.654 |
| 11.7671 | 91.629 |
| 11.7748 | 91.604 |
| 11.7826 | 91.579 |
| 11.7903 | 91.554 |
| 11.798 | 91.529 |
| 11.8057 | 91.503 |
| 11.8135 | 91.478 |
| 11.8212 | 91.451 |
| 11.8289 | 91.425 |
| 11.8366 | 91.398 |
| 11.8443 | 91.371 |
| 11.8521 | 91.344 |
| 11.8598 | 91.317 |
| 11.8675 | 91.29 |
| 11.8752 | 91.264 |
| 11.8829 | 91.237 |
| 11.8907 | 91.211 |
| 11.8984 | 91.186 |
| 11.9061 | 91.16 |
| 11.9138 | 91.136 |
| 11.9216 | 91.11 |
| 11.9293 | 91.086 |
| 11.937 | 91.061 |
| 11.9447 | 91.036 |
| 11.9524 | 91.01 |
| 11.9602 | 90.984 |
| 11.9679 | 90.957 |
| 11.9756 | 90.93 |
| 11.9833 | 90.902 |
| 11.991 | 90.873 |
| 11.9988 | 90.844 |
| 12.0065 | 90.816 |
| 12.0142 | 90.786 |
| 12.0219 | 90.756 |
| 12.0296 | 90.727 |
| 12.0374 | 90.695 |
| 12.0451 | 90.664 |
| 12.0528 | 90.632 |
| 12.0605 | 90.6 |
| 12.0683 | 90.567 |
| 12.076 | 90.533 |
| 12.0837 | 90.5 |
| 12.0914 | 90.467 |
| 12.0991 | 90.435 |
| 12.1069 | 90.404 |
| 12.1146 | 90.372 |
| 12.1223 | 90.344 |
| 12.13 | 90.317 |
| 12.1377 | 90.29 |
| 12.1455 | 90.263 |
| 12.1532 | 90.238 |
| 12.1609 | 90.212 |
| 12.1686 | 90.186 |
| 12.1764 | 90.16 |
| 12.1841 | 90.132 |
| 12.1918 | 90.105 |
| 12.1995 | 90.078 |
| 12.2072 | 90.049 |
| 12.215 | 90.02 |
| 12.2227 | 89.992 |
| 12.2304 | 89.963 |
| 12.2381 | 89.934 |
| 12.2458 | 89.905 |
| 12.2536 | 89.876 |
| 12.2613 | 89.847 |
| 12.269 | 89.818 |
| 12.2767 | 89.789 |
| 12.2844 | 89.76 |
| 12.2922 | 89.731 |
| 12.2999 | 89.701 |
| 12.3076 | 89.672 |
| 12.3153 | 89.642 |
| 12.3231 | 89.611 |
| 12.3308 | 89.581 |
| 12.3385 | 89.55 |
| 12.3462 | 89.519 |
| 12.3539 | 89.489 |
| 12.3617 | 89.458 |
| 12.3694 | 89.428 |
| 12.3771 | 89.397 |
| 12.3848 | 89.368 |
| 12.3925 | 89.338 |
| 12.4003 | 89.308 |
| 12.408 | 89.278 |
| 12.4157 | 89.247 |
| 12.4234 | 89.216 |
| 12.4312 | 89.185 |
| 12.4389 | 89.153 |
| 12.4466 | 89.12 |
| 12.4543 | 89.086 |
| 12.462 | 89.053 |
| 12.4698 | 89.019 |
| 12.4775 | 88.984 |
| 12.4852 | 88.95 |
| 12.4929 | 88.916 |
| 12.5006 | 88.882 |
| 12.5084 | 88.848 |
| 12.5161 | 88.814 |
| 12.5238 | 88.78 |
| 12.5315 | 88.745 |
| 12.5392 | 88.71 |
| 12.547 | 88.676 |
| 12.5547 | 88.641 |
| 12.5624 | 88.606 |
| 12.5701 | 88.57 |
| 12.5779 | 88.534 |
| 12.5856 | 88.498 |
| 12.5933 | 88.462 |
| 12.601 | 88.425 |
| 12.6087 | 88.388 |
| 12.6165 | 88.352 |
| 12.6242 | 88.315 |
| 12.6319 | 88.279 |
| 12.6396 | 88.242 |
| 12.6473 | 88.206 |
| 12.6551 | 88.17 |
| 12.6628 | 88.134 |
| 12.6705 | 88.097 |
| 12.6782 | 88.061 |
| 12.686 | 88.025 |
| 12.6937 | 87.989 |
| 12.7014 | 87.954 |
| 12.7091 | 87.918 |
| 12.7168 | 87.883 |
| 12.7246 | 87.848 |
| 12.7323 | 87.812 |
| 12.74 | 87.778 |
| 12.7477 | 87.743 |
| 12.7554 | 87.709 |
| 12.7632 | 87.674 |
| 12.7709 | 87.64 |
| 12.7786 | 87.606 |
| 12.7863 | 87.572 |
| 12.794 | 87.538 |
| 12.8018 | 87.504 |
| 12.8095 | 87.47 |
| 12.8172 | 87.436 |
| 12.8249 | 87.402 |
| 12.8327 | 87.368 |
| 12.8404 | 87.335 |
| 12.8481 | 87.301 |
| 12.8558 | 87.268 |
| 12.8635 | 87.235 |
| 12.8713 | 87.202 |
| 12.879 | 87.169 |
| 12.8867 | 87.136 |
| 12.8944 | 87.103 |
| 12.9021 | 87.069 |
| 12.9099 | 87.036 |
| 12.9176 | 87.002 |
| 12.9253 | 86.969 |
| 12.933 | 86.935 |
| 12.9408 | 86.902 |
| 12.9485 | 86.868 |
| 12.9562 | 86.834 |
| 12.9639 | 86.801 |
| 12.9716 | 86.768 |
| 12.9794 | 86.736 |
| 12.9871 | 86.704 |
| 12.9948 | 86.671 |
| 13.0025 | 86.639 |
| 13.0102 | 86.606 |
| 13.018 | 86.574 |
| 13.0257 | 86.541 |
| 13.0334 | 86.507 |
| 13.0411 | 86.471 |
| 13.0488 | 86.436 |
| 13.0566 | 86.4 |
| 13.0643 | 86.364 |
| 13.072 | 86.325 |
| 13.0797 | 86.286 |
| 13.0875 | 86.248 |
| 13.0952 | 86.209 |
| 13.1029 | 86.168 |
| 13.1106 | 86.126 |
| 13.1183 | 86.085 |
| 13.1261 | 86.044 |
| 13.1338 | 86.002 |
| 13.1415 | 85.96 |
| 13.1492 | 85.918 |
| 13.1569 | 85.877 |
| 13.1647 | 85.837 |
| 13.1724 | 85.801 |
| 13.1801 | 85.765 |
| 13.1878 | 85.728 |
| 13.1956 | 85.693 |
| 13.2033 | 85.664 |
| 13.211 | 85.635 |
| 13.2187 | 85.606 |
| 13.2264 | 85.577 |
| 13.2342 | 85.547 |
| 13.2419 | 85.517 |
| 13.2496 | 85.487 |
| 13.2573 | 85.457 |
| 13.265 | 85.424 |
| 13.2728 | 85.388 |
| 13.2805 | 85.351 |
| 13.2882 | 85.315 |
| 13.2959 | 85.278 |
| 13.3036 | 85.238 |
| 13.3114 | 85.198 |
| 13.3191 | 85.158 |
| 13.3268 | 85.118 |
| 13.3345 | 85.078 |
| 13.3423 | 85.038 |
| 13.35 | 84.998 |
| 13.3577 | 84.958 |
| 13.3654 | 84.918 |
| 13.3731 | 84.88 |
| 13.3809 | 84.841 |
| 13.3886 | 84.802 |
| 13.3963 | 84.763 |
| 13.404 | 84.726 |
| 13.4117 | 84.689 |
| 13.4195 | 84.652 |
| 13.4272 | 84.615 |
| 13.4349 | 84.578 |
| 13.4426 | 84.544 |
| 13.4504 | 84.509 |
| 13.4581 | 84.475 |
| 13.4658 | 84.441 |
| 13.4735 | 84.408 |
| 13.4812 | 84.376 |
| 13.489 | 84.345 |
| 13.4967 | 84.313 |
| 13.5044 | 84.282 |
| 13.5121 | 84.25 |
| 13.5198 | 84.218 |
| 13.5276 | 84.186 |
| 13.5353 | 84.154 |
| 13.543 | 84.119 |
| 13.5507 | 84.08 |
| 13.5584 | 84.042 |
| 13.5662 | 84.004 |
| 13.5739 | 83.966 |
| 13.5816 | 83.921 |
| 13.5893 | 83.876 |
| 13.5971 | 83.831 |
| 13.6048 | 83.786 |
| 13.6125 | 83.74 |
| 13.6202 | 83.693 |
| 13.6279 | 83.646 |
| 13.6357 | 83.599 |
| 13.6434 | 83.552 |
| 13.6511 | 83.507 |
| 13.6588 | 83.463 |
| 13.6665 | 83.419 |
| 13.6743 | 83.375 |
| 13.682 | 83.331 |
| 13.6897 | 83.292 |
| 13.6974 | 83.253 |
| 13.7052 | 83.214 |
| 13.7129 | 83.174 |
| 13.7206 | 83.136 |
| 13.7283 | 83.1 |
| 13.736 | 83.064 |
| 13.7438 | 83.028 |
| 13.7515 | 82.992 |
| 13.7592 | 82.956 |
| 13.7669 | 82.921 |
| 13.7746 | 82.885 |
| 13.7824 | 82.85 |
| 13.7901 | 82.814 |
| 13.7978 | 82.777 |
| 13.8055 | 82.74 |
| 13.8132 | 82.703 |
| 13.821 | 82.666 |
| 13.8287 | 82.629 |
| 13.8364 | 82.589 |
| 13.8441 | 82.55 |
| 13.8519 | 82.51 |
| 13.8596 | 82.47 |
| 13.8673 | 82.43 |
| 13.875 | 82.388 |
| 13.8827 | 82.347 |
| 13.8905 | 82.305 |
| 13.8982 | 82.263 |
| 13.9059 | 82.222 |
| 13.9136 | 82.18 |
| 13.9213 | 82.138 |
| 13.9291 | 82.096 |
| 13.9368 | 82.055 |
| 13.9445 | 82.014 |
| 13.9522 | 81.974 |
| 13.96 | 81.934 |
| 13.9677 | 81.894 |
| 13.9754 | 81.854 |
| 13.9831 | 81.815 |
| 13.9908 | 81.776 |
| 13.9986 | 81.738 |
| 14.0063 | 81.699 |
| 14.014 | 81.661 |
| 14.0217 | 81.622 |
| 14.0294 | 81.583 |
| 14.0372 | 81.544 |
| 14.0449 | 81.505 |
| 14.0526 | 81.466 |
| 14.0603 | 81.42 |
| 14.068 | 81.375 |
| 14.0758 | 81.33 |
| 14.0835 | 81.284 |
| 14.0912 | 81.239 |
| 14.0989 | 81.184 |
| 14.1067 | 81.13 |
| 14.1144 | 81.076 |
| 14.1221 | 81.022 |
| 14.1298 | 80.967 |
| 14.1375 | 80.911 |
| 14.1453 | 80.855 |
| 14.153 | 80.799 |
| 14.1607 | 80.743 |
| 14.1684 | 80.688 |
| 14.1761 | 80.64 |
| 14.1839 | 80.591 |
| 14.1916 | 80.543 |
| 14.1993 | 80.495 |
| 14.207 | 80.447 |
| 14.2148 | 80.406 |
| 14.2225 | 80.365 |
| 14.2302 | 80.324 |
| 14.2379 | 80.283 |
| 14.2456 | 80.242 |
| 14.2534 | 80.2 |
| 14.2611 | 80.158 |
| 14.2688 | 80.116 |
| 14.2765 | 80.074 |
| 14.2842 | 80.032 |
| 14.292 | 79.985 |
| 14.2997 | 79.937 |
| 14.3074 | 79.89 |
| 14.3151 | 79.842 |
| 14.3228 | 79.795 |
| 14.3306 | 79.744 |
| 14.3383 | 79.693 |
| 14.346 | 79.641 |
| 14.3537 | 79.59 |
| 14.3615 | 79.538 |
| 14.3692 | 79.485 |
| 14.3769 | 79.43 |
| 14.3846 | 79.375 |
| 14.3923 | 79.321 |
| 14.4001 | 79.266 |
| 14.4078 | 79.209 |
| 14.4155 | 79.151 |
| 14.4232 | 79.092 |
| 14.4309 | 79.034 |
| 14.4387 | 78.975 |
| 14.4464 | 78.916 |
| 14.4541 | 78.857 |
| 14.4618 | 78.798 |
| 14.4696 | 78.739 |
| 14.4773 | 78.68 |
| 14.485 | 78.621 |
| 14.4927 | 78.566 |
| 14.5004 | 78.511 |
| 14.5082 | 78.456 |
| 14.5159 | 78.401 |
| 14.5236 | 78.346 |
| 14.5313 | 78.296 |
| 14.539 | 78.246 |
| 14.5468 | 78.196 |
| 14.5545 | 78.147 |
| 14.5622 | 78.097 |
| 14.5699 | 78.048 |
| 14.5776 | 78 |
| 14.5854 | 77.952 |
| 14.5931 | 77.903 |
| 14.6008 | 77.855 |
| 14.6085 | 77.806 |
| 14.6163 | 77.752 |
| 14.624 | 77.699 |
| 14.6317 | 77.646 |
| 14.6394 | 77.592 |
| 14.6471 | 77.539 |
| 14.6549 | 77.477 |
| 14.6626 | 77.414 |
| 14.6703 | 77.351 |
| 14.678 | 77.288 |
| 14.6857 | 77.225 |
| 14.6935 | 77.158 |
| 14.7012 | 77.087 |
| 14.7089 | 77.016 |
| 14.7166 | 76.946 |
| 14.7244 | 76.875 |
| 14.7321 | 76.804 |
| 14.7398 | 76.73 |
| 14.7475 | 76.657 |
| 14.7552 | 76.583 |
| 14.763 | 76.51 |
| 14.7707 | 76.437 |
| 14.7784 | 76.365 |
| 14.7861 | 76.294 |
| 14.7938 | 76.224 |
| 14.8016 | 76.154 |
| 14.8093 | 76.083 |
| 14.817 | 76.014 |
| 14.8247 | 75.951 |
| 14.8324 | 75.888 |
| 14.8402 | 75.825 |
| 14.8479 | 75.762 |
| 14.8556 | 75.699 |
| 14.8633 | 75.635 |
| 14.8711 | 75.57 |
| 14.8788 | 75.506 |
| 14.8865 | 75.441 |
| 14.8942 | 75.377 |
| 14.9019 | 75.308 |
| 14.9097 | 75.211 |
| 14.9174 | 75.114 |
| 14.9251 | 75.017 |
| 14.9328 | 74.92 |
| 14.9405 | 74.824 |
| 14.9483 | 74.71 |
| 14.956 | 74.584 |
| 14.9637 | 74.458 |
| 14.9714 | 74.333 |
| 14.9792 | 74.207 |
| 14.9869 | 74.082 |
| 14.9946 | 73.988 |
| 15.0023 | 73.895 |
| 15.01 | 73.802 |
| 15.0178 | 73.708 |
| 15.0255 | 73.616 |
| 15.0332 | 73.53 |
| 15.0409 | 73.458 |
| 15.0486 | 73.386 |
| 15.0564 | 73.313 |
| 15.0641 | 73.241 |
| 15.0718 | 73.169 |
| 15.0795 | 73.087 |
| 15.0872 | 73 |
| 15.095 | 72.914 |
| 15.1027 | 72.828 |
| 15.1104 | 72.742 |
| 15.1181 | 72.655 |
| 15.1259 | 72.549 |
| 15.1336 | 72.443 |
| 15.1413 | 72.337 |
| 15.149 | 72.231 |
| 15.1567 | 72.126 |
| 15.1645 | 72.017 |
| 15.1722 | 71.903 |
| 15.1799 | 71.789 |
| 15.1876 | 71.676 |
| 15.1953 | 71.562 |
| 15.2031 | 71.449 |
| 15.2108 | 71.337 |
| 15.2185 | 71.226 |
| 15.2262 | 71.116 |
| 15.234 | 71.005 |
| 15.2417 | 70.895 |
| 15.2494 | 70.785 |
| 15.2571 | 70.677 |
| 15.2648 | 70.57 |
| 15.2726 | 70.463 |
| 15.2803 | 70.357 |
| 15.288 | 70.25 |
| 15.2957 | 70.144 |
| 15.3034 | 70.034 |
| 15.3112 | 69.925 |
| 15.3189 | 69.816 |
| 15.3266 | 69.706 |
| 15.3343 | 69.597 |
| 15.342 | 69.488 |
| 15.3498 | 69.377 |
| 15.3575 | 69.266 |
| 15.3652 | 69.156 |
| 15.3729 | 69.045 |
| 15.3807 | 68.934 |
| 15.3884 | 68.825 |
| 15.3961 | 68.717 |
| 15.4038 | 68.61 |
| 15.4115 | 68.502 |
| 15.4193 | 68.395 |
| 15.427 | 68.288 |
| 15.4347 | 68.181 |
| 15.4424 | 68.073 |
| 15.4501 | 67.964 |
| 15.4579 | 67.856 |
| 15.4656 | 67.749 |
| 15.4733 | 67.641 |
| 15.481 | 67.53 |
| 15.4888 | 67.412 |
| 15.4965 | 67.294 |
| 15.5042 | 67.176 |
| 15.5119 | 67.059 |
| 15.5196 | 66.941 |
| 15.5274 | 66.82 |
| 15.5351 | 66.692 |
| 15.5428 | 66.563 |
| 15.5505 | 66.434 |
| 15.5582 | 66.306 |
| 15.566 | 66.177 |
| 15.5737 | 66.048 |
| 15.5814 | 65.917 |
| 15.5891 | 65.785 |
| 15.5968 | 65.654 |
| 15.6046 | 65.522 |
| 15.6123 | 65.391 |
| 15.62 | 65.261 |
| 15.6277 | 65.134 |
| 15.6355 | 65.008 |
| 15.6432 | 64.882 |
| 15.6509 | 64.756 |
| 15.6586 | 64.63 |
| 15.6663 | 64.505 |
| 15.6741 | 64.39 |
| 15.6818 | 64.274 |
| 15.6895 | 64.159 |
| 15.6972 | 64.045 |
| 15.7049 | 63.93 |
| 15.7127 | 63.815 |
| 15.7204 | 63.711 |
| 15.7281 | 63.609 |
| 15.7358 | 63.506 |
| 15.7436 | 63.404 |
| 15.7513 | 63.301 |
| 15.759 | 63.199 |
| 15.7667 | 63.099 |
| 15.7744 | 63 |
| 15.7822 | 62.9 |
| 15.7899 | 62.802 |
| 15.7976 | 62.703 |
| 15.8053 | 62.604 |
| 15.813 | 62.499 |
| 15.8208 | 62.388 |
| 15.8285 | 62.278 |
| 15.8362 | 62.167 |
| 15.8439 | 62.057 |
| 15.8516 | 61.946 |
| 15.8594 | 61.832 |
| 15.8671 | 61.7 |
| 15.8748 | 61.569 |
| 15.8825 | 61.438 |
| 15.8903 | 61.307 |
| 15.898 | 61.176 |
| 15.9057 | 61.046 |
| 15.9134 | 60.895 |
| 15.9211 | 60.742 |
| 15.9289 | 60.59 |
| 15.9366 | 60.437 |
| 15.9443 | 60.285 |
| 15.952 | 60.133 |
| 15.9597 | 59.972 |
| 15.9675 | 59.806 |
| 15.9752 | 59.64 |
| 15.9829 | 59.474 |
| 15.9906 | 59.308 |
| 15.9984 | 59.142 |
| 16.0061 | 58.977 |
| 16.0138 | 58.816 |
| 16.0215 | 58.654 |
| 16.0292 | 58.493 |
| 16.037 | 58.332 |
| 16.0447 | 58.171 |
| 16.0524 | 58.01 |
| 16.0601 | 57.866 |
| 16.0678 | 57.727 |
| 16.0756 | 57.587 |
| 16.0833 | 57.448 |
| 16.091 | 57.309 |
| 16.0987 | 57.17 |
| 16.1064 | 57.039 |
| 16.1142 | 56.926 |
| 16.1219 | 56.813 |
| 16.1296 | 56.7 |
| 16.1373 | 56.586 |
| 16.1451 | 56.474 |
| 16.1528 | 56.361 |
| 16.1605 | 56.27 |
| 16.1682 | 56.184 |
| 16.1759 | 56.098 |
| 16.1837 | 56.012 |
| 16.1914 | 55.926 |
| 16.1991 | 55.84 |
| 16.2068 | 55.762 |
| 16.2145 | 55.706 |
| 16.2223 | 55.649 |
| 16.23 | 55.593 |
| 16.2377 | 55.536 |
| 16.2454 | 55.48 |
| 16.2532 | 55.424 |
| 16.2609 | 55.385 |
| 16.2686 | 55.353 |
| 16.2763 | 55.321 |
| 16.284 | 55.289 |
| 16.2918 | 55.257 |
| 16.2995 | 55.226 |
| 16.3072 | 55.195 |
| 16.3149 | 55.176 |
| 16.3226 | 55.157 |
| 16.3304 | 55.138 |
| 16.3381 | 55.118 |
| 16.3458 | 55.099 |
| 16.3535 | 55.08 |
| 16.3612 | 55.062 |
| 16.369 | 55.046 |
| 16.3767 | 55.03 |
| 16.3844 | 55.014 |
| 16.3921 | 54.998 |
| 16.3999 | 54.982 |
| 16.4076 | 54.966 |
| 16.4153 | 54.95 |
| 16.423 | 54.932 |
| 16.4307 | 54.915 |
| 16.4385 | 54.898 |
| 16.4462 | 54.881 |
| 16.4539 | 54.864 |
| 16.4616 | 54.847 |
| 16.4693 | 54.826 |
| 16.4771 | 54.805 |
| 16.4848 | 54.784 |
| 16.4925 | 54.763 |
| 16.5002 | 54.742 |
| 16.508 | 54.72 |
| 16.5157 | 54.697 |
| 16.5234 | 54.666 |
| 16.5311 | 54.635 |
| 16.5388 | 54.604 |
| 16.5466 | 54.572 |
| 16.5543 | 54.541 |
| 16.562 | 54.51 |
| 16.5697 | 54.472 |
| 16.5774 | 54.421 |
| 16.5852 | 54.37 |
| 16.5929 | 54.32 |
| 16.6006 | 54.269 |
| 16.6083 | 54.218 |
| 16.616 | 54.167 |
| 16.6238 | 54.105 |
| 16.6315 | 54.03 |
| 16.6392 | 53.954 |
| 16.6469 | 53.879 |
| 16.6547 | 53.804 |
| 16.6624 | 53.729 |
| 16.6701 | 53.654 |
| 16.6778 | 53.57 |
| 16.6855 | 53.477 |
| 16.6933 | 53.384 |
| 16.701 | 53.292 |
| 16.7087 | 53.199 |
| 16.7164 | 53.107 |
| 16.7241 | 53.014 |
| 16.7319 | 52.917 |
| 16.7396 | 52.816 |
| 16.7473 | 52.714 |
| 16.755 | 52.613 |
| 16.7628 | 52.512 |
| 16.7705 | 52.411 |
| 16.7782 | 52.311 |
| 16.7859 | 52.205 |
| 16.7936 | 52.095 |
| 16.8014 | 51.986 |
| 16.8091 | 51.876 |
| 16.8168 | 51.767 |
| 16.8245 | 51.658 |
| 16.8322 | 51.549 |
| 16.84 | 51.433 |
| 16.8477 | 51.312 |
| 16.8554 | 51.192 |
| 16.8631 | 51.071 |
| 16.8708 | 50.95 |
| 16.8786 | 50.83 |
| 16.8863 | 50.709 |
| 16.894 | 50.586 |
| 16.9017 | 50.458 |
| 16.9095 | 50.331 |
| 16.9172 | 50.204 |
| 16.9249 | 50.077 |
| 16.9326 | 49.95 |
| 16.9403 | 49.823 |
| 16.9481 | 49.696 |
| 16.9558 | 49.569 |
| 16.9635 | 49.442 |
| 16.9712 | 49.316 |
| 16.9789 | 49.189 |
| 16.9867 | 49.062 |
| 16.9944 | 48.936 |
| 17.0021 | 48.81 |
| 17.0098 | 48.684 |
| 17.0176 | 48.558 |
| 17.0253 | 48.431 |
| 17.033 | 48.306 |
| 17.0407 | 48.18 |
| 17.0484 | 48.054 |
| 17.0562 | 47.928 |
| 17.0639 | 47.801 |
| 17.0716 | 47.673 |
| 17.0793 | 47.545 |
| 17.087 | 47.418 |
| 17.0948 | 47.291 |
| 17.1025 | 47.163 |
| 17.1102 | 47.036 |
| 17.1179 | 46.908 |
| 17.1256 | 46.779 |
| 17.1334 | 46.65 |
| 17.1411 | 46.521 |
| 17.1488 | 46.392 |
| 17.1565 | 46.264 |
| 17.1643 | 46.136 |
| 17.172 | 46.007 |
| 17.1797 | 45.88 |
| 17.1874 | 45.753 |
| 17.1951 | 45.626 |
| 17.2029 | 45.499 |
| 17.2106 | 45.372 |
| 17.2183 | 45.245 |
| 17.226 | 45.119 |
| 17.2337 | 45 |
| 17.2415 | 44.882 |
| 17.2492 | 44.765 |
| 17.2569 | 44.648 |
| 17.2646 | 44.53 |
| 17.2724 | 44.413 |
| 17.2801 | 44.296 |
| 17.2878 | 44.186 |
| 17.2955 | 44.085 |
| 17.3032 | 43.985 |
| 17.311 | 43.884 |
| 17.3187 | 43.784 |
| 17.3264 | 43.684 |
| 17.3341 | 43.583 |
| 17.3418 | 43.483 |
| 17.3496 | 43.4 |
| 17.3573 | 43.319 |
| 17.365 | 43.238 |
| 17.3727 | 43.156 |
| 17.3804 | 43.076 |
| 17.3882 | 42.995 |
| 17.3959 | 42.914 |
| 17.4036 | 42.84 |
| 17.4113 | 42.778 |
| 17.4191 | 42.716 |
| 17.4268 | 42.654 |
| 17.4345 | 42.593 |
| 17.4422 | 42.531 |
| 17.4499 | 42.47 |
| 17.4577 | 42.408 |
| 17.4654 | 42.358 |
| 17.4731 | 42.311 |
| 17.4808 | 42.264 |
| 17.4885 | 42.218 |
| 17.4963 | 42.171 |
| 17.504 | 42.125 |
| 17.5117 | 42.078 |
| 17.5194 | 42.033 |
| 17.5271 | 41.995 |
| 17.5349 | 41.956 |
| 17.5426 | 41.918 |
| 17.5503 | 41.88 |
| 17.558 | 41.842 |
| 17.5658 | 41.804 |
| 17.5735 | 41.766 |
| 17.5812 | 41.73 |
| 17.5889 | 41.697 |
| 17.5966 | 41.663 |
| 17.6044 | 41.63 |
| 17.6121 | 41.597 |
| 17.6198 | 41.564 |
| 17.6275 | 41.53 |
| 17.6352 | 41.497 |
| 17.643 | 41.466 |
| 17.6507 | 41.437 |
| 17.6584 | 41.407 |
| 17.6661 | 41.378 |
| 17.6739 | 41.348 |
| 17.6816 | 41.319 |
| 17.6893 | 41.289 |
| 17.697 | 41.26 |
| 17.7047 | 41.233 |
| 17.7125 | 41.206 |
| 17.7202 | 41.179 |
| 17.7279 | 41.152 |
| 17.7356 | 41.125 |
| 17.7433 | 41.098 |
| 17.7511 | 41.071 |
| 17.7588 | 41.044 |
| 17.7665 | 41.017 |
| 17.7742 | 40.99 |
| 17.7819 | 40.963 |
| 17.7897 | 40.937 |
| 17.7974 | 40.91 |
| 17.8051 | 40.883 |
| 17.8128 | 40.856 |
| 17.8206 | 40.829 |
| 17.8283 | 40.8 |
| 17.836 | 40.77 |
| 17.8437 | 40.741 |
| 17.8514 | 40.712 |
| 17.8592 | 40.682 |
| 17.8669 | 40.653 |
| 17.8746 | 40.624 |
| 17.8823 | 40.593 |
| 17.89 | 40.558 |
| 17.8978 | 40.522 |
| 17.9055 | 40.486 |
| 17.9132 | 40.451 |
| 17.9209 | 40.416 |
| 17.9287 | 40.38 |
| 17.9364 | 40.345 |
| 17.9441 | 40.308 |
| 17.9518 | 40.264 |
| 17.9595 | 40.22 |
| 17.9673 | 40.176 |
| 17.975 | 40.132 |
| 17.9827 | 40.088 |
| 17.9904 | 40.045 |
| 17.9981 | 40.001 |
| 18.0059 | 39.956 |
| 18.0136 | 39.906 |
| 18.0213 | 39.855 |
| 18.029 | 39.805 |
| 18.0367 | 39.754 |
| 18.0445 | 39.704 |
| 18.0522 | 39.653 |
| 18.0599 | 39.603 |
| 18.0676 | 39.552 |
| 18.0754 | 39.497 |
| 18.0831 | 39.441 |
| 18.0908 | 39.385 |
| 18.0985 | 39.329 |
| 18.1062 | 39.274 |
| 18.114 | 39.218 |
| 18.1217 | 39.163 |
| 18.1294 | 39.107 |
| 18.1371 | 39.047 |
| 18.1448 | 38.985 |
| 18.1526 | 38.923 |
| 18.1603 | 38.862 |
| 18.168 | 38.8 |
| 18.1757 | 38.738 |
| 18.1835 | 38.677 |
| 18.1912 | 38.616 |
| 18.1989 | 38.551 |
| 18.2066 | 38.485 |
| 18.2143 | 38.418 |
| 18.2221 | 38.352 |
| 18.2298 | 38.285 |
| 18.2375 | 38.219 |
| 18.2452 | 38.152 |
| 18.2529 | 38.086 |
| 18.2607 | 38.019 |
| 18.2684 | 37.949 |
| 18.2761 | 37.879 |
| 18.2838 | 37.809 |
| 18.2915 | 37.739 |
| 18.2993 | 37.669 |
| 18.307 | 37.599 |
| 18.3147 | 37.529 |
| 18.3224 | 37.46 |
| 18.3302 | 37.387 |
| 18.3379 | 37.314 |
| 18.3456 | 37.241 |
| 18.3533 | 37.168 |
| 18.361 | 37.095 |
| 18.3688 | 37.022 |
| 18.3765 | 36.95 |
| 18.3842 | 36.877 |
| 18.3919 | 36.803 |
| 18.3996 | 36.728 |
| 18.4074 | 36.653 |
| 18.4151 | 36.578 |
| 18.4228 | 36.504 |
| 18.4305 | 36.429 |
| 18.4383 | 36.354 |
| 18.446 | 36.28 |
| 18.4537 | 36.205 |
| 18.4614 | 36.128 |
| 18.4691 | 36.051 |
| 18.4769 | 35.974 |
| 18.4846 | 35.898 |
| 18.4923 | 35.821 |
| 18.5 | 35.744 |
| 18.5077 | 35.668 |
| 18.5155 | 35.591 |
| 18.5232 | 35.512 |
| 18.5309 | 35.431 |
| 18.5386 | 35.35 |
| 18.5463 | 35.268 |
| 18.5541 | 35.187 |
| 18.5618 | 35.106 |
| 18.5695 | 35.025 |
| 18.5772 | 34.944 |
| 18.585 | 34.863 |
| 18.5927 | 34.777 |
| 18.6004 | 34.691 |
| 18.6081 | 34.605 |
| 18.6158 | 34.519 |
| 18.6236 | 34.432 |
| 18.6313 | 34.346 |
| 18.639 | 34.26 |
| 18.6467 | 34.175 |
| 18.6544 | 34.088 |
| 18.6622 | 33.997 |
| 18.6699 | 33.907 |
| 18.6776 | 33.816 |
| 18.6853 | 33.726 |
| 18.6931 | 33.636 |
| 18.7008 | 33.545 |
| 18.7085 | 33.455 |
| 18.7162 | 33.365 |
| 18.7239 | 33.272 |
| 18.7317 | 33.176 |
| 18.7394 | 33.08 |
| 18.7471 | 32.985 |
| 18.7548 | 32.889 |
| 18.7625 | 32.794 |
| 18.7703 | 32.698 |
| 18.778 | 32.603 |
| 18.7857 | 32.508 |
| 18.7934 | 32.407 |
| 18.8011 | 32.304 |
| 18.8089 | 32.201 |
| 18.8166 | 32.098 |
| 18.8243 | 31.996 |
| 18.832 | 31.893 |
| 18.8398 | 31.79 |
| 18.8475 | 31.688 |
| 18.8552 | 31.586 |
| 18.8629 | 31.475 |
| 18.8706 | 31.363 |
| 18.8784 | 31.252 |
| 18.8861 | 31.14 |
| 18.8938 | 31.028 |
| 18.9015 | 30.917 |
| 18.9092 | 30.806 |
| 18.917 | 30.694 |
| 18.9247 | 30.583 |
| 18.9324 | 30.461 |
| 18.9401 | 30.338 |
| 18.9479 | 30.215 |
| 18.9556 | 30.093 |
| 18.9633 | 29.97 |
| 18.971 | 29.848 |
| 18.9787 | 29.726 |
| 18.9865 | 29.604 |
| 18.9942 | 29.482 |
| 19.0019 | 29.354 |
| 19.0096 | 29.227 |
| 19.0173 | 29.1 |
| 19.0251 | 28.973 |
| 19.0328 | 28.846 |
| 19.0405 | 28.719 |
| 19.0482 | 28.593 |
| 19.0559 | 28.466 |
| 19.0637 | 28.34 |
| 19.0714 | 28.218 |
| 19.0791 | 28.097 |
| 19.0868 | 27.976 |
| 19.0946 | 27.856 |
| 19.1023 | 27.735 |
| 19.11 | 27.615 |
| 19.1177 | 27.494 |
| 19.1254 | 27.374 |
| 19.1332 | 27.254 |
| 19.1409 | 27.137 |
| 19.1486 | 27.021 |
| 19.1563 | 26.905 |
| 19.164 | 26.789 |
| 19.1718 | 26.674 |
| 19.1795 | 26.558 |
| 19.1872 | 26.442 |
| 19.1949 | 26.327 |
| 19.2027 | 26.212 |
| 19.2104 | 26.092 |
| 19.2181 | 25.969 |
| 19.2258 | 25.846 |
| 19.2335 | 25.724 |
| 19.2413 | 25.601 |
| 19.249 | 25.479 |
| 19.2567 | 25.357 |
| 19.2644 | 25.235 |
| 19.2721 | 25.113 |
| 19.2799 | 24.987 |
| 19.2876 | 24.855 |
| 19.2953 | 24.723 |
| 19.303 | 24.59 |
| 19.3107 | 24.459 |
| 19.3185 | 24.327 |
| 19.3262 | 24.195 |
| 19.3339 | 24.064 |
| 19.3416 | 23.932 |
| 19.3494 | 23.8 |
| 19.3571 | 23.665 |
| 19.3648 | 23.53 |
| 19.3725 | 23.395 |
| 19.3802 | 23.26 |
| 19.388 | 23.125 |
| 19.3957 | 22.99 |
| 19.4034 | 22.856 |
| 19.4111 | 22.721 |
| 19.4188 | 22.587 |
| 19.4266 | 22.451 |
| 19.4343 | 22.314 |
| 19.442 | 22.176 |
| 19.4497 | 22.039 |
| 19.4575 | 21.902 |
| 19.4652 | 21.766 |
| 19.4729 | 21.629 |
| 19.4806 | 21.492 |
| 19.4883 | 21.356 |
| 19.4961 | 21.218 |
| 19.5038 | 21.073 |
| 19.5115 | 20.929 |
| 19.5192 | 20.785 |
| 19.5269 | 20.641 |
| 19.5347 | 20.497 |
| 19.5424 | 20.353 |
| 19.5501 | 20.209 |
| 19.5578 | 20.066 |
| 19.5655 | 19.922 |
| 19.5733 | 19.772 |
| 19.581 | 19.618 |
| 19.5887 | 19.464 |
| 19.5964 | 19.31 |
| 19.6042 | 19.157 |
| 19.6119 | 19.004 |
| 19.6196 | 18.85 |
| 19.6273 | 18.697 |
| 19.635 | 18.544 |
| 19.6428 | 18.391 |
| 19.6505 | 18.229 |
| 19.6582 | 18.067 |
| 19.6659 | 17.906 |
| 19.6736 | 17.745 |
| 19.6814 | 17.584 |
| 19.6891 | 17.422 |
| 19.6968 | 17.262 |
| 19.7045 | 17.101 |
| 19.7123 | 16.94 |
| 19.72 | 16.779 |
| 19.7277 | 16.617 |
| 19.7354 | 16.456 |
| 19.7431 | 16.294 |
| 19.7509 | 16.133 |
| 19.7586 | 15.972 |
| 19.7663 | 15.811 |
| 19.774 | 15.65 |
| 19.7817 | 15.49 |
| 19.7895 | 15.329 |
| 19.7972 | 15.169 |
| 19.8049 | 15.01 |
| 19.8126 | 14.851 |
| 19.8203 | 14.693 |
| 19.8281 | 14.534 |
| 19.8358 | 14.376 |
| 19.8435 | 14.217 |
| 19.8512 | 14.059 |
| 19.859 | 13.901 |
| 19.8667 | 13.743 |
| 19.8744 | 13.589 |
| 19.8821 | 13.437 |
| 19.8898 | 13.285 |
| 19.8976 | 13.133 |
| 19.9053 | 12.981 |
| 19.913 | 12.829 |
| 19.9207 | 12.677 |
| 19.9284 | 12.525 |
| 19.9362 | 12.374 |
| 19.9439 | 12.222 |
| 19.9516 | 12.089 |
| 19.9593 | 11.957 |
| 19.9671 | 11.825 |
| 19.9748 | 11.693 |
| 19.9825 | 11.561 |
| 19.9902 | 11.429 |
| 19.9979 | 11.298 |
| 20.0057 | 11.166 |
| 20.0134 | 11.034 |
| 20.0211 | 10.903 |